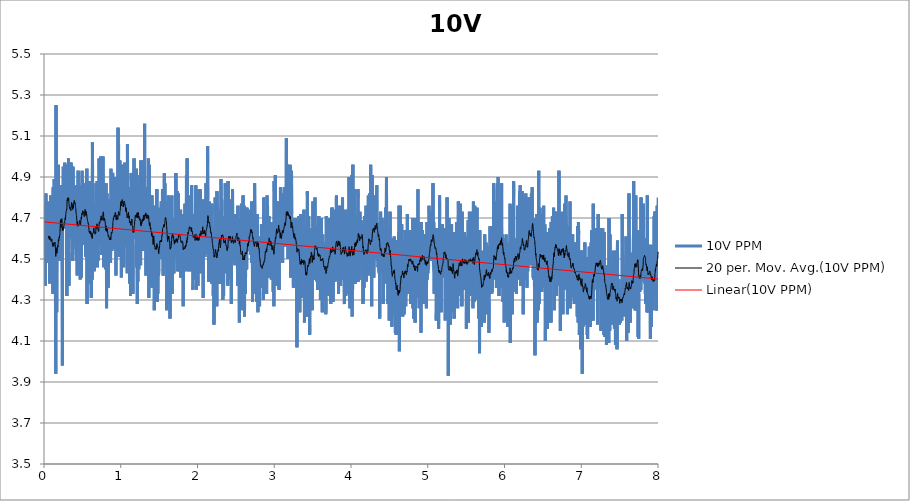
| Category | 10V PPM |
|---|---|
| 0.0009014404444444445 | 4.66 |
| 0.003960782083333334 | 4.77 |
| 0.007023179472222222 | 4.43 |
| 0.010082798916666667 | 4.67 |
| 0.013142973944444445 | 4.61 |
| 0.01620231561111111 | 4.37 |
| 0.019261657249999998 | 4.57 |
| 0.0223215545 | 4.72 |
| 0.02538089613888889 | 4.82 |
| 0.028439959999999997 | 4.61 |
| 0.03149930166666667 | 4.52 |
| 0.034559754472222225 | 4.61 |
| 0.037619373916666664 | 4.56 |
| 0.04067871558333333 | 4.59 |
| 0.043738057222222224 | 4.78 |
| 0.04679739888888889 | 4.67 |
| 0.04985701833333333 | 4.67 |
| 0.05291635997222222 | 4.48 |
| 0.05597597941666666 | 4.54 |
| 0.059035598861111115 | 4.49 |
| 0.06209466272222222 | 4.77 |
| 0.06515567113888888 | 4.49 |
| 0.06821584616666666 | 4.64 |
| 0.07127518780555556 | 4.6 |
| 0.07433480725 | 4.38 |
| 0.07739414891666667 | 4.66 |
| 0.08045321277777778 | 4.45 |
| 0.08351311 | 4.58 |
| 0.0865721738611111 | 4.81 |
| 0.08963151552777779 | 4.49 |
| 0.09269085716666665 | 4.53 |
| 0.09575158777777777 | 4.54 |
| 0.09881092944444443 | 4.74 |
| 0.10187082666666668 | 4.64 |
| 0.10492989052777778 | 4.49 |
| 0.10798923219444444 | 4.63 |
| 0.11104829602777777 | 4.45 |
| 0.11410763769444444 | 4.5 |
| 0.11716697933333332 | 4.33 |
| 0.12022604319444445 | 4.85 |
| 0.12328566263888889 | 4.48 |
| 0.12634500430555556 | 4.49 |
| 0.12940406816666666 | 4.65 |
| 0.132463132 | 4.89 |
| 0.13552330705555557 | 4.4 |
| 0.1385829265 | 4.57 |
| 0.1416422681388889 | 4.47 |
| 0.14470188758333333 | 4.65 |
| 0.14776122922222223 | 4.36 |
| 0.1508205708888889 | 4.18 |
| 0.15388019033333333 | 3.94 |
| 0.15693925419444443 | 5.25 |
| 0.15999859583333334 | 4.89 |
| 0.1630579375 | 4.43 |
| 0.16611700133333332 | 4.24 |
| 0.169176343 | 4.53 |
| 0.1722356846388889 | 4.68 |
| 0.17529530408333333 | 4.68 |
| 0.17835520133333335 | 4.68 |
| 0.18141454297222223 | 4.7 |
| 0.18447360683333333 | 4.71 |
| 0.1875368376111111 | 4.96 |
| 0.1905967348333333 | 4.68 |
| 0.19365718766666667 | 4.8 |
| 0.1967176405 | 4.73 |
| 0.1997792045 | 4.49 |
| 0.20284049069444443 | 4.68 |
| 0.2059014991111111 | 4.68 |
| 0.20896084075000002 | 4.78 |
| 0.21202101580555555 | 4.74 |
| 0.21508202419444444 | 4.51 |
| 0.21814247702777778 | 4.86 |
| 0.22120209647222222 | 4.49 |
| 0.22426393827777777 | 4.69 |
| 0.2273235577222222 | 4.74 |
| 0.23038428833333333 | 4.65 |
| 0.2334444633611111 | 4.65 |
| 0.23650630516666665 | 4.28 |
| 0.2395675913611111 | 3.98 |
| 0.24262915536111113 | 4.86 |
| 0.24568877480555557 | 4.79 |
| 0.24874811647222222 | 4.71 |
| 0.2518074581111111 | 4.95 |
| 0.25486791094444444 | 4.77 |
| 0.2579280859722222 | 4.83 |
| 0.2609913167222222 | 4.65 |
| 0.2640520473611111 | 4.91 |
| 0.26711722266666665 | 4.65 |
| 0.2701776755 | 4.97 |
| 0.2732603518055556 | 4.85 |
| 0.2763194156666667 | 4.75 |
| 0.2793798685 | 4.65 |
| 0.2824392101388889 | 4.86 |
| 0.28549882958333334 | 4.95 |
| 0.28855817125 | 4.9 |
| 0.29161751288888893 | 4.74 |
| 0.29467685455555553 | 4.76 |
| 0.29773619619444447 | 4.32 |
| 0.30079553786111113 | 4.89 |
| 0.30385515730555557 | 4.78 |
| 0.30691449894444445 | 4.84 |
| 0.3099752295555555 | 4.96 |
| 0.313034849 | 4.86 |
| 0.31609419066666666 | 4.58 |
| 0.31915325452777776 | 4.99 |
| 0.32221315175 | 4.73 |
| 0.32527582694444446 | 4.37 |
| 0.3283354463888889 | 4.53 |
| 0.3313945102222222 | 4.68 |
| 0.3344538518888889 | 4.77 |
| 0.33751486030555555 | 4.82 |
| 0.34057447975000005 | 4.75 |
| 0.34363382138888887 | 4.61 |
| 0.3466942742222222 | 4.97 |
| 0.3497558382222222 | 4.75 |
| 0.3528149020833333 | 4.97 |
| 0.3558742437222222 | 4.9 |
| 0.3589335853888889 | 4.77 |
| 0.3619934826111111 | 4.6 |
| 0.3650531020555556 | 4.95 |
| 0.3681121659166666 | 4.73 |
| 0.3711720631666667 | 4.86 |
| 0.37423612730555555 | 4.49 |
| 0.37729519116666665 | 4.95 |
| 0.38035508838888893 | 4.77 |
| 0.3834147078333333 | 4.83 |
| 0.38647488286111115 | 4.82 |
| 0.38953478011111115 | 4.59 |
| 0.39259439955555553 | 4.73 |
| 0.39565374119444446 | 4.86 |
| 0.3987130828611111 | 4.57 |
| 0.4017721467222222 | 4.68 |
| 0.4048314883611111 | 4.71 |
| 0.40789110780555554 | 4.65 |
| 0.4109504494722222 | 4.65 |
| 0.4140103466944445 | 4.81 |
| 0.4170694105555555 | 4.55 |
| 0.42012875222222223 | 4.56 |
| 0.4231883716666667 | 4.49 |
| 0.42624771330555555 | 4.6 |
| 0.4293081661388889 | 4.56 |
| 0.43236778558333333 | 4.42 |
| 0.43542740502777777 | 4.86 |
| 0.43848730225 | 4.71 |
| 0.4415466439166667 | 4.54 |
| 0.4446059855555556 | 4.93 |
| 0.44766532722222224 | 4.81 |
| 0.4507246688611111 | 4.64 |
| 0.4537840105 | 4.74 |
| 0.4568433521666667 | 4.85 |
| 0.45990324941666666 | 4.82 |
| 0.46296231325000003 | 4.84 |
| 0.46602304388888893 | 4.72 |
| 0.46908544124999996 | 4.6 |
| 0.47214506069444445 | 4.4 |
| 0.4752069025 | 4.68 |
| 0.47826652194444447 | 4.8 |
| 0.48132641919444447 | 4.71 |
| 0.48438576083333335 | 4.86 |
| 0.4874503805555555 | 4.41 |
| 0.4905097222222222 | 4.75 |
| 0.49357323077777776 | 4.75 |
| 0.49663423919444444 | 4.93 |
| 0.4996944142222222 | 4.57 |
| 0.5027543114444445 | 4.89 |
| 0.5058358766111111 | 4.78 |
| 0.50889994075 | 4.8 |
| 0.5119620603333334 | 4.69 |
| 0.5150222353611111 | 4.76 |
| 0.518081577 | 4.57 |
| 0.5211445299722222 | 4.67 |
| 0.5242149833888889 | 4.87 |
| 0.5272784919444444 | 4.66 |
| 0.5303408893055556 | 4.81 |
| 0.53340050875 | 4.85 |
| 0.5364606838055556 | 4.65 |
| 0.5395200254444444 | 4.6 |
| 0.5425793670833333 | 4.51 |
| 0.5456384309444444 | 4.73 |
| 0.5486983281944444 | 4.78 |
| 0.5517590588055555 | 4.68 |
| 0.5548203450277778 | 4.51 |
| 0.5578799644722222 | 4.94 |
| 0.5609398616944444 | 4.28 |
| 0.56400337025 | 4.75 |
| 0.5670652120555556 | 4.65 |
| 0.5701248315 | 4.71 |
| 0.5731861176944445 | 4.57 |
| 0.5762535153611111 | 4.62 |
| 0.579318412888889 | 4.61 |
| 0.5823780323333334 | 4.38 |
| 0.5854382073611112 | 4.58 |
| 0.5884981046111111 | 4.41 |
| 0.5915630021388889 | 4.88 |
| 0.5946242883333334 | 4.7 |
| 0.5976839077777778 | 4.63 |
| 0.6007438050277777 | 4.59 |
| 0.6038053690277777 | 4.72 |
| 0.6068669330277777 | 4.68 |
| 0.6099287748055556 | 4.51 |
| 0.6129889498611111 | 4.86 |
| 0.6160510694444444 | 4.31 |
| 0.6191159669722222 | 4.72 |
| 0.6221755864166667 | 4.45 |
| 0.62523465025 | 4.66 |
| 0.6282978810277777 | 4.4 |
| 0.6313580560555556 | 5.07 |
| 0.6344176755 | 4.73 |
| 0.6374772949444445 | 4.62 |
| 0.6405388589444444 | 4.63 |
| 0.6435987561944445 | 4.52 |
| 0.6466630981111111 | 4.74 |
| 0.6497257733055556 | 4.62 |
| 0.652786226111111 | 4.61 |
| 0.6558483457222222 | 4.44 |
| 0.6589090763333334 | 4.59 |
| 0.6619686957777777 | 4.56 |
| 0.6650305375555556 | 4.7 |
| 0.6680926571666667 | 4.77 |
| 0.671153943361111 | 4.65 |
| 0.6742143961944443 | 4.75 |
| 0.6772748490277777 | 4.87 |
| 0.6803408577222222 | 4.62 |
| 0.6834035328888889 | 4.55 |
| 0.6864650968888889 | 4.58 |
| 0.6895272164722223 | 4.81 |
| 0.6925868359166667 | 4.88 |
| 0.69564728875 | 4.46 |
| 0.698708019361111 | 4.63 |
| 0.7017695833611111 | 4.59 |
| 0.7048294806111112 | 4.49 |
| 0.70788882225 | 4.54 |
| 0.7109506640555556 | 4.63 |
| 0.7140100056944444 | 4.65 |
| 0.7170693473611112 | 4.99 |
| 0.7201292445833334 | 4.85 |
| 0.7231891418333333 | 4.6 |
| 0.7262487612777777 | 4.57 |
| 0.7293081029166667 | 4.92 |
| 0.7323674445833334 | 4.74 |
| 0.735427619611111 | 4.82 |
| 0.7384872390555556 | 5 |
| 0.7415490808333334 | 4.81 |
| 0.7446092558888889 | 4.64 |
| 0.7476683197222223 | 4.56 |
| 0.7507276613888889 | 4.52 |
| 0.7537872808333334 | 4.76 |
| 0.7568477336666667 | 4.62 |
| 0.7599104088333334 | 4.57 |
| 0.7629725284166666 | 4.58 |
| 0.7660352035833333 | 4.67 |
| 0.7690948230277778 | 5 |
| 0.7721549980833333 | 4.72 |
| 0.77521767325 | 4.6 |
| 0.778278403861111 | 4.46 |
| 0.7813383011111111 | 4.54 |
| 0.7843979205555556 | 4.77 |
| 0.7874619846944444 | 4.69 |
| 0.7905229931111112 | 4.82 |
| 0.79358233475 | 4.6 |
| 0.796642232 | 4.74 |
| 0.7997015736388889 | 4.61 |
| 0.80276230425 | 4.45 |
| 0.8058224793055556 | 4.51 |
| 0.8088851544722223 | 4.87 |
| 0.8119500519999999 | 4.64 |
| 0.8150093936388888 | 4.26 |
| 0.8180726244166667 | 4.63 |
| 0.8211352995833334 | 4.82 |
| 0.8241960301944444 | 4.54 |
| 0.8272562052222222 | 4.53 |
| 0.8303169358611111 | 4.72 |
| 0.8333787776388889 | 4.64 |
| 0.8364389526666667 | 4.36 |
| 0.8395002388888889 | 4.54 |
| 0.8425623584722222 | 4.56 |
| 0.845629478361111 | 4.67 |
| 0.8486899311666667 | 4.56 |
| 0.8517506618055556 | 4.67 |
| 0.8548116701944445 | 4.54 |
| 0.8578721230277777 | 4.79 |
| 0.8609361871666668 | 4.62 |
| 0.8639971955833333 | 4.66 |
| 0.8670573706111111 | 4.48 |
| 0.8701172678611111 | 4.64 |
| 0.8731793874444445 | 4.94 |
| 0.8762426182222223 | 4.61 |
| 0.8793025154444445 | 4.74 |
| 0.8823621348888889 | 4.7 |
| 0.8854234211111112 | 4.54 |
| 0.8884847073055555 | 4.67 |
| 0.8915448823333333 | 4.81 |
| 0.8946086686944444 | 4.92 |
| 0.8976716216666667 | 4.89 |
| 0.9007323522777777 | 4.72 |
| 0.903792805111111 | 4.83 |
| 0.9068554802777777 | 4.55 |
| 0.9099159331111111 | 4.81 |
| 0.9129813862222221 | 4.72 |
| 0.9160410056666667 | 4.61 |
| 0.9191053475833333 | 4.67 |
| 0.9221644114444444 | 4.65 |
| 0.9252254198611112 | 4.9 |
| 0.9282875394444444 | 4.62 |
| 0.9313468811111111 | 4.62 |
| 0.93440622275 | 4.55 |
| 0.9374661200000001 | 4.42 |
| 0.9405329620833334 | 4.6 |
| 0.9435923037222222 | 4.78 |
| 0.9466519231666666 | 4.82 |
| 0.9497129315833334 | 4.81 |
| 0.9527725510277778 | 4.65 |
| 0.9558330038611111 | 4.74 |
| 0.9588931788888889 | 4.79 |
| 0.9619536317222223 | 4.72 |
| 0.9650154734999999 | 5.14 |
| 0.9680750929444445 | 4.75 |
| 0.971134434611111 | 5.06 |
| 0.9741976653611111 | 4.54 |
| 0.9772586737777778 | 4.62 |
| 0.9803205155555555 | 4.51 |
| 0.9833823573611111 | 4.73 |
| 0.9864422546111111 | 4.8 |
| 0.989503818611111 | 4.98 |
| 0.9925651048055555 | 4.71 |
| 0.9956258354166666 | 4.89 |
| 0.9986851770833333 | 4.7 |
| 1.0017445187222223 | 4.84 |
| 1.0048041381666666 | 4.81 |
| 1.0078690356944444 | 4.41 |
| 1.0109311552777778 | 4.88 |
| 1.013991608111111 | 4.96 |
| 1.0170551166666666 | 4.91 |
| 1.0201155695 | 4.84 |
| 1.0231749111388888 | 4.65 |
| 1.0262353639722221 | 4.86 |
| 1.0292988725277779 | 4.79 |
| 1.0323601587222222 | 4.65 |
| 1.0354211671388889 | 4.83 |
| 1.038480231 | 4.46 |
| 1.0415395726666667 | 4.89 |
| 1.0446022478333334 | 4.78 |
| 1.0476668675555556 | 4.61 |
| 1.0507292649444444 | 4.97 |
| 1.0537894399722223 | 4.68 |
| 1.0568543375000001 | 4.74 |
| 1.0599150681111111 | 4.56 |
| 1.062986354888889 | 4.58 |
| 1.066047918888889 | 4.59 |
| 1.0691089273055554 | 4.77 |
| 1.07216854675 | 4.69 |
| 1.07523011075 | 4.73 |
| 1.0782894524166666 | 4.81 |
| 1.0813526831666667 | 4.59 |
| 1.0844161917222221 | 4.43 |
| 1.08747636675 | 5.06 |
| 1.090536264 | 4.81 |
| 1.093597828 | 4.78 |
| 1.0966588364166667 | 4.8 |
| 1.0997215115833332 | 4.7 |
| 1.1027819644166665 | 4.63 |
| 1.1058454729722222 | 4.44 |
| 1.1089062035833332 | 4.85 |
| 1.111968045388889 | 4.63 |
| 1.1150346096666668 | 4.38 |
| 1.1180945068888888 | 4.85 |
| 1.12115357075 | 4.39 |
| 1.1242181905 | 4.73 |
| 1.127277532138889 | 4.32 |
| 1.1303385405555555 | 4.76 |
| 1.1334020491111112 | 4.58 |
| 1.13646139075 | 4.92 |
| 1.1395285106388888 | 4.86 |
| 1.1425897968333334 | 4.71 |
| 1.1456519164166667 | 4.7 |
| 1.148711535861111 | 4.52 |
| 1.1517733776666668 | 4.7 |
| 1.1548354972500001 | 4.73 |
| 1.1578948389166668 | 4.33 |
| 1.160954458361111 | 4.57 |
| 1.1640140778055554 | 4.65 |
| 1.1670767529722221 | 4.68 |
| 1.1701363724166665 | 4.6 |
| 1.1731987698055557 | 4.99 |
| 1.1762589448333334 | 4.64 |
| 1.1793213422222222 | 4.93 |
| 1.1823812394444444 | 4.8 |
| 1.1854436368333334 | 4.76 |
| 1.1885040896666668 | 4.8 |
| 1.1915650980555557 | 4.66 |
| 1.1946291622222223 | 4.7 |
| 1.197691004 | 4.87 |
| 1.2007536791666666 | 4.74 |
| 1.2038191322777778 | 4.94 |
| 1.2068795851111112 | 4.46 |
| 1.2099419825 | 4.78 |
| 1.2130027131111112 | 4.86 |
| 1.2160642771111112 | 4.28 |
| 1.2191252855277779 | 4.81 |
| 1.2221901830555557 | 4.39 |
| 1.2252498025 | 4.65 |
| 1.2283138666388889 | 4.72 |
| 1.2313765418055556 | 4.73 |
| 1.2344406059722224 | 4.45 |
| 1.2375168930277778 | 4.83 |
| 1.240577623638889 | 4.76 |
| 1.2436372430833333 | 4.77 |
| 1.2466979737222221 | 4.57 |
| 1.2497628712222222 | 4.91 |
| 1.2528236018611112 | 4.72 |
| 1.2559004445 | 4.51 |
| 1.2589622863055554 | 4.47 |
| 1.2620213501666666 | 4.98 |
| 1.265085969888889 | 4.56 |
| 1.2681458671388888 | 4.84 |
| 1.271207431138889 | 4.7 |
| 1.2742951077222222 | 4.83 |
| 1.2773569495277777 | 4.63 |
| 1.28041684675 | 4.61 |
| 1.283477577388889 | 4.61 |
| 1.2865380301944445 | 4.62 |
| 1.2895995942222223 | 4.82 |
| 1.292662824972222 | 4.54 |
| 1.2957221666111112 | 4.98 |
| 1.2987826194444445 | 4.67 |
| 1.3018480725555555 | 4.56 |
| 1.304907692 | 4.7 |
| 1.3079703671666667 | 4.77 |
| 1.3110294310277777 | 5.16 |
| 1.3140896060555556 | 4.66 |
| 1.3171525590277777 | 4.55 |
| 1.3202119006944446 | 4.6 |
| 1.3232717979166666 | 4.8 |
| 1.32633225075 | 4.85 |
| 1.3293927035833333 | 4.42 |
| 1.3324534341944445 | 4.74 |
| 1.3355133314444445 | 4.68 |
| 1.3385751732222222 | 4.77 |
| 1.3416347926666667 | 4.83 |
| 1.3446955233055558 | 4.49 |
| 1.3477779218055554 | 4.69 |
| 1.3508389302222223 | 4.57 |
| 1.3539027165833333 | 4.56 |
| 1.356967891888889 | 4.83 |
| 1.3600344561944444 | 4.99 |
| 1.3630943534166666 | 4.51 |
| 1.3661567508055554 | 4.31 |
| 1.3692172036388888 | 4.57 |
| 1.372277100861111 | 4.96 |
| 1.3753433873611112 | 4.5 |
| 1.3784038401944445 | 4.81 |
| 1.38146734875 | 4.65 |
| 1.3845283571666667 | 4.41 |
| 1.3875882543888889 | 4.62 |
| 1.3906481516388887 | 4.57 |
| 1.3937077710833334 | 4.37 |
| 1.3967710018333332 | 4.66 |
| 1.3998325658333333 | 4.81 |
| 1.4028927408611112 | 4.38 |
| 1.405954304861111 | 4.81 |
| 1.4090161466666666 | 4.36 |
| 1.4120765995 | 4.45 |
| 1.4151448305277778 | 4.69 |
| 1.4182041721944445 | 4.56 |
| 1.42127240325 | 4.41 |
| 1.4243361895833333 | 4.72 |
| 1.4273988647777778 | 4.76 |
| 1.4304607065555555 | 4.75 |
| 1.4335419939166667 | 4.58 |
| 1.436603280111111 | 4.25 |
| 1.4396681776388889 | 4.46 |
| 1.442727519277778 | 4.61 |
| 1.4457876943333334 | 4.45 |
| 1.4488484249444447 | 4.31 |
| 1.4519102667500001 | 4.69 |
| 1.4549712751388888 | 4.36 |
| 1.4580356170833335 | 4.61 |
| 1.4610980144722223 | 4.72 |
| 1.4641587450833335 | 4.67 |
| 1.4672205868888888 | 4.61 |
| 1.4702821508888888 | 4.84 |
| 1.4733417703333334 | 4.29 |
| 1.4764033343333334 | 4.57 |
| 1.479462953777778 | 4.65 |
| 1.4825234065833333 | 4.33 |
| 1.485584970611111 | 4.54 |
| 1.4886551461944444 | 4.7 |
| 1.491714765638889 | 4.42 |
| 1.494774662888889 | 4.42 |
| 1.4978348379166666 | 4.45 |
| 1.5008950129444445 | 4.69 |
| 1.5039549101944443 | 4.75 |
| 1.5070253635833335 | 4.7 |
| 1.5101135957777778 | 4.72 |
| 1.5131734930277778 | 4.62 |
| 1.5162328346666667 | 4.52 |
| 1.5192921763055556 | 4.5 |
| 1.5223548515 | 4.68 |
| 1.5254158599166665 | 4.68 |
| 1.5284779795 | 4.78 |
| 1.5315375989444444 | 4.66 |
| 1.5345972183888887 | 4.75 |
| 1.5376612825277778 | 4.75 |
| 1.5407220131388888 | 4.66 |
| 1.5437852439166666 | 4.84 |
| 1.5468451411388888 | 4.67 |
| 1.549905038388889 | 4.8 |
| 1.5529652134166667 | 4.42 |
| 1.5560270552222222 | 4.52 |
| 1.5590861190555556 | 4.62 |
| 1.5621460163055556 | 4.71 |
| 1.5652061913333333 | 4.51 |
| 1.5682691443055556 | 4.92 |
| 1.571330986111111 | 4.67 |
| 1.5743953280277778 | 4.87 |
| 1.5774546696944445 | 4.71 |
| 1.5805176226666668 | 4.78 |
| 1.5835786310833333 | 4.73 |
| 1.58664130625 | 4.65 |
| 1.5897014812777777 | 4.59 |
| 1.592761934111111 | 4.57 |
| 1.5958271094166667 | 4.53 |
| 1.5988897845833334 | 4.25 |
| 1.6019502374166668 | 4.42 |
| 1.6050126348055556 | 4.33 |
| 1.6080775323333334 | 4.3 |
| 1.6111452077777777 | 4.61 |
| 1.6142062161944444 | 4.52 |
| 1.6172655578611113 | 4.77 |
| 1.6203268440555556 | 4.81 |
| 1.6233867413055554 | 4.44 |
| 1.6264460829444445 | 4.76 |
| 1.6295065357777778 | 4.64 |
| 1.6325661552222221 | 4.63 |
| 1.6356304971666666 | 4.62 |
| 1.6386928945277777 | 4.7 |
| 1.6417594588333335 | 4.21 |
| 1.6448243563333333 | 4.6 |
| 1.6478839758055557 | 4.8 |
| 1.6509441508333333 | 4.56 |
| 1.6540037702777777 | 4.59 |
| 1.657065889861111 | 4.75 |
| 1.660135509861111 | 4.5 |
| 1.6631951293055556 | 4.65 |
| 1.6662608602222222 | 4.81 |
| 1.6693207574722222 | 4.33 |
| 1.6723814880833334 | 4.64 |
| 1.6754458300277777 | 4.7 |
| 1.67851044975 | 4.5 |
| 1.6815697913888887 | 4.64 |
| 1.6846302442222223 | 4.64 |
| 1.687689585888889 | 4.66 |
| 1.6907672619166667 | 4.43 |
| 1.6938313260555555 | 4.44 |
| 1.6968909455 | 4.44 |
| 1.699950009361111 | 4.56 |
| 1.7030107399722223 | 4.58 |
| 1.706070637222222 | 4.58 |
| 1.7091327568055554 | 4.58 |
| 1.7121926540277779 | 4.68 |
| 1.7152592183333333 | 4.67 |
| 1.7183199489444445 | 4.92 |
| 1.7213815129444445 | 4.51 |
| 1.7244430769444443 | 4.67 |
| 1.7275024185833334 | 4.57 |
| 1.7305617602499999 | 4.55 |
| 1.7336213796944444 | 4.54 |
| 1.7366859994166668 | 4.44 |
| 1.7397456188611111 | 4.83 |
| 1.7428063494722221 | 4.62 |
| 1.7458659689166667 | 4.65 |
| 1.7489272551388888 | 4.68 |
| 1.75198798575 | 4.82 |
| 1.755047883 | 4.44 |
| 1.7581091691944446 | 4.53 |
| 1.761168510861111 | 4.52 |
| 1.7642289636666666 | 4.64 |
| 1.7672888609166666 | 4.48 |
| 1.7703543140277778 | 4.58 |
| 1.7734136556666666 | 4.51 |
| 1.7764741085 | 4.5 |
| 1.7795367836666667 | 4.74 |
| 1.7825966809166667 | 4.41 |
| 1.7856621340277776 | 4.56 |
| 1.788732309638889 | 4.58 |
| 1.7917941514166666 | 4.55 |
| 1.7948587711666666 | 4.56 |
| 1.797921724138889 | 4.58 |
| 1.8009835659166666 | 4.72 |
| 1.804043185361111 | 4.5 |
| 1.8071036381944443 | 4.72 |
| 1.810167980138889 | 4.54 |
| 1.8132281551666667 | 4.27 |
| 1.8162922193055555 | 4.5 |
| 1.8193518387499998 | 4.6 |
| 1.8224142361388889 | 4.57 |
| 1.8254744111666665 | 4.54 |
| 1.8285354195833332 | 4.45 |
| 1.831596428 | 4.65 |
| 1.8346591031666668 | 4.44 |
| 1.8377203893611112 | 4.77 |
| 1.8407825089444443 | 4.61 |
| 1.843842128388889 | 4.57 |
| 1.8469100816666666 | 4.65 |
| 1.8499697011111111 | 4.45 |
| 1.8530320984722224 | 4.7 |
| 1.8560922735277778 | 4.91 |
| 1.85915217075 | 4.64 |
| 1.8622123457777777 | 4.51 |
| 1.8652747431666665 | 4.99 |
| 1.868336029361111 | 4.54 |
| 1.8714037048333332 | 4.7 |
| 1.87446471325 | 4.79 |
| 1.8775243326944444 | 4.44 |
| 1.8805842299166668 | 4.52 |
| 1.8836444049722223 | 4.81 |
| 1.886703746611111 | 4.56 |
| 1.8897650328055555 | 4.69 |
| 1.8928393753333332 | 4.77 |
| 1.8959012171111111 | 4.53 |
| 1.8989611143611111 | 4.6 |
| 1.9020224005555555 | 4.73 |
| 1.9050831311944443 | 4.49 |
| 1.9081455285555555 | 4.64 |
| 1.9112098704999998 | 4.44 |
| 1.914268934361111 | 4.67 |
| 1.9173382765833333 | 4.71 |
| 1.9203976182222222 | 4.58 |
| 1.9234569598888889 | 4.86 |
| 1.9265168571388889 | 4.62 |
| 1.9295770321666665 | 4.58 |
| 1.93263915175 | 4.62 |
| 1.9357034936944446 | 4.6 |
| 1.9387642243055554 | 4.35 |
| 1.9418246771388887 | 4.37 |
| 1.9448842965833335 | 4.71 |
| 1.9479461383611112 | 4.61 |
| 1.9510071467777779 | 4.69 |
| 1.9540695441666667 | 4.72 |
| 1.9571322193333334 | 4.66 |
| 1.9601932277499998 | 4.71 |
| 1.9632561807222222 | 4.4 |
| 1.9663158001666667 | 4.45 |
| 1.969375419611111 | 4.45 |
| 1.9724361502222223 | 4.74 |
| 1.9755060480277777 | 4.81 |
| 1.9785670564444444 | 4.86 |
| 1.981632787361111 | 4.57 |
| 1.984692129 | 4.35 |
| 1.987778138861111 | 4.78 |
| 1.9908410918055557 | 4.5 |
| 1.99390543375 | 4.54 |
| 1.996967831138889 | 4.56 |
| 2.0000391179166668 | 4.59 |
| 2.003100126333333 | 4.45 |
| 2.0061655794444446 | 4.37 |
| 2.0092260322777777 | 4.68 |
| 2.012285373916667 | 4.84 |
| 2.0153494380555554 | 4.58 |
| 2.0184121132222224 | 4.6 |
| 2.0214772885555554 | 4.78 |
| 2.024551353277778 | 4.67 |
| 2.027610694916667 | 4.68 |
| 2.0306705921666666 | 4.43 |
| 2.0337324339444445 | 4.84 |
| 2.036796498083333 | 4.76 |
| 2.0398583398888888 | 4.69 |
| 2.0429182371388888 | 4.77 |
| 2.0459778565833333 | 4.64 |
| 2.049037476027778 | 4.45 |
| 2.052096539861111 | 4.51 |
| 2.0551581038611113 | 4.61 |
| 2.058221612416667 | 4.48 |
| 2.0612845653888887 | 4.65 |
| 2.0643450182222223 | 4.67 |
| 2.0674046376666664 | 4.79 |
| 2.070464534916667 | 4.58 |
| 2.073526932277778 | 4.31 |
| 2.076586829527778 | 4.65 |
| 2.0796483935277776 | 4.7 |
| 2.082708012972222 | 4.7 |
| 2.0857687435833334 | 4.72 |
| 2.088830585388889 | 4.62 |
| 2.0918952051111113 | 4.69 |
| 2.0949556579444444 | 4.51 |
| 2.098015832972222 | 4.68 |
| 2.101076008 | 4.79 |
| 2.1041364608333333 | 4.53 |
| 2.107197747027778 | 4.62 |
| 2.1102618111666667 | 4.87 |
| 2.1133217084166667 | 4.61 |
| 2.116382439027778 | 4.65 |
| 2.1194476143611114 | 4.65 |
| 2.122510845111111 | 4.73 |
| 2.1255707423611114 | 4.87 |
| 2.128630639583333 | 4.79 |
| 2.1316910924166668 | 5.05 |
| 2.134754323194444 | 4.79 |
| 2.1378161649722225 | 4.52 |
| 2.140891340861111 | 4.7 |
| 2.143952904861111 | 4.39 |
| 2.1470136355 | 4.48 |
| 2.1500738105277777 | 4.58 |
| 2.1531362078888887 | 4.78 |
| 2.1561997164444446 | 4.5 |
| 2.159259058111111 | 4.45 |
| 2.1623211776944444 | 4.54 |
| 2.165380797138889 | 4.55 |
| 2.168440694388889 | 4.51 |
| 2.171500313833333 | 4.5 |
| 2.174566322527778 | 4.49 |
| 2.1776345535555555 | 4.71 |
| 2.180694173027778 | 4.55 |
| 2.1837543480555555 | 4.38 |
| 2.1868145230833336 | 4.77 |
| 2.189876364861111 | 4.72 |
| 2.1929357065277775 | 4.72 |
| 2.195994770388889 | 4.59 |
| 2.1990557788055556 | 4.45 |
| 2.202122065277778 | 4.38 |
| 2.205185851638889 | 4.32 |
| 2.2082549160555556 | 4.38 |
| 2.2113162022777777 | 4.62 |
| 2.2143777662777775 | 4.18 |
| 2.2174398858611113 | 4.37 |
| 2.220501449861111 | 4.63 |
| 2.2235610693055556 | 4.42 |
| 2.2266315226944444 | 4.53 |
| 2.2296936422777778 | 4.8 |
| 2.2327535395277778 | 4.72 |
| 2.2358131589722223 | 4.69 |
| 2.2388722228333333 | 4.49 |
| 2.2419321200555555 | 4.53 |
| 2.245003406861111 | 4.3 |
| 2.2480641374722223 | 4.72 |
| 2.2511262570555557 | 4.27 |
| 2.2541872654722224 | 4.83 |
| 2.2572485516666667 | 4.63 |
| 2.2603081711111113 | 4.76 |
| 2.2633711240833336 | 4.51 |
| 2.2664324103055553 | 4.49 |
| 2.2694920297500003 | 4.44 |
| 2.272554149333333 | 4.45 |
| 2.2756151577500003 | 4.59 |
| 2.2786772773333333 | 4.74 |
| 2.281743841611111 | 4.6 |
| 2.284804294444444 | 4.68 |
| 2.2878683585833333 | 4.71 |
| 2.2909993710000003 | 4.38 |
| 2.2940617683888886 | 4.59 |
| 2.2971222211944444 | 4.38 |
| 2.3001821184444444 | 4.68 |
| 2.3032453491944445 | 4.7 |
| 2.3063083021666664 | 4.89 |
| 2.309372366305556 | 4.63 |
| 2.3124325413611113 | 4.64 |
| 2.3154943831388892 | 4.79 |
| 2.318555113777778 | 4.67 |
| 2.3216177889444443 | 4.66 |
| 2.324679908527778 | 4.6 |
| 2.327741472527778 | 4.55 |
| 2.33080609225 | 4.3 |
| 2.3338696008055555 | 4.46 |
| 2.3369286646666665 | 4.4 |
| 2.3399896730833336 | 4.32 |
| 2.343052070472222 | 4.54 |
| 2.3461122455 | 4.71 |
| 2.349174642888889 | 4.71 |
| 2.3522350956944447 | 4.5 |
| 2.355294437361111 | 4.43 |
| 2.3583540568055557 | 4.53 |
| 2.3614150652222223 | 4.87 |
| 2.364474406861111 | 4.55 |
| 2.367534304111111 | 4.62 |
| 2.3705978126666665 | 4.47 |
| 2.373657432111111 | 4.66 |
| 2.376725385361111 | 4.73 |
| 2.3797897273055555 | 4.51 |
| 2.382854069222222 | 4.49 |
| 2.3859145220555558 | 4.46 |
| 2.3889744193055553 | 4.63 |
| 2.3920526509166664 | 4.55 |
| 2.3951256044444444 | 4.37 |
| 2.398185223888889 | 4.88 |
| 2.4012484546666664 | 4.73 |
| 2.4043114076388887 | 4.78 |
| 2.4073724160555554 | 4.68 |
| 2.410434535638889 | 4.52 |
| 2.4134972108055557 | 4.62 |
| 2.4165571080555557 | 4.47 |
| 2.4196172830833333 | 4.64 |
| 2.42268468075 | 4.46 |
| 2.425744022388889 | 4.62 |
| 2.428805030805556 | 4.79 |
| 2.4318643724722224 | 4.6 |
| 2.4349237141111115 | 4.4 |
| 2.4379858336944444 | 4.61 |
| 2.441080455138889 | 4.28 |
| 2.4441411857777777 | 4.61 |
| 2.4472069166666666 | 4.54 |
| 2.4502670916944442 | 4.59 |
| 2.4533328226111113 | 4.52 |
| 2.456394386611111 | 4.84 |
| 2.4594551172222223 | 4.6 |
| 2.4625164034444444 | 4.67 |
| 2.465579078611111 | 4.64 |
| 2.468639531444444 | 4.49 |
| 2.471699706472222 | 4.69 |
| 2.474760714888889 | 4.71 |
| 2.47781977875 | 4.59 |
| 2.4808824539166667 | 4.64 |
| 2.4839426289444444 | 4.52 |
| 2.4870030817777775 | 4.47 |
| 2.4900638123888887 | 4.58 |
| 2.493125376388889 | 4.72 |
| 2.496185829222222 | 4.55 |
| 2.499245170861111 | 4.71 |
| 2.502305068111111 | 4.55 |
| 2.5053696878333334 | 4.68 |
| 2.508434029777778 | 4.54 |
| 2.5114961493611108 | 4.69 |
| 2.514556324388889 | 4.65 |
| 2.5176176106111114 | 4.52 |
| 2.520678619 | 4.45 |
| 2.523744627722222 | 4.37 |
| 2.526805358333333 | 4.76 |
| 2.5298680335 | 4.71 |
| 2.532930430888889 | 4.67 |
| 2.535990883722222 | 4.64 |
| 2.5390516143333333 | 4.63 |
| 2.542113456138889 | 4.37 |
| 2.5451741867499997 | 4.19 |
| 2.548234917361111 | 4.7 |
| 2.5512987037222223 | 4.65 |
| 2.5543594343333336 | 4.26 |
| 2.557419331583333 | 4.56 |
| 2.5604795066111112 | 4.31 |
| 2.5635388482500003 | 4.28 |
| 2.5665987455 | 4.56 |
| 2.569661420666667 | 4.47 |
| 2.5727254848055554 | 4.77 |
| 2.5757853820555554 | 4.63 |
| 2.578853890888889 | 4.53 |
| 2.5819146215 | 4.5 |
| 2.5849761855000004 | 4.59 |
| 2.5880358049444445 | 4.38 |
| 2.59109598 | 4.25 |
| 2.5941561550277776 | 4.81 |
| 2.5972185523888887 | 4.47 |
| 2.600279838611111 | 4.73 |
| 2.6033402914444443 | 4.31 |
| 2.6064029666111113 | 4.52 |
| 2.6094628638333335 | 4.76 |
| 2.6125394286944443 | 4.22 |
| 2.61560765975 | 4.63 |
| 2.618672557277778 | 4.57 |
| 2.621734399083333 | 4.61 |
| 2.624794851888889 | 4.33 |
| 2.6278553047222224 | 4.54 |
| 2.6309143685833334 | 4.45 |
| 2.633975099194444 | 4.64 |
| 2.637034718638889 | 4.75 |
| 2.6400968382222225 | 4.45 |
| 2.6431631247222223 | 4.65 |
| 2.646222466388889 | 4.75 |
| 2.6492831970000004 | 4.58 |
| 2.6523430942222226 | 4.73 |
| 2.6554052138333333 | 4.54 |
| 2.6584648332777774 | 4.71 |
| 2.6615288974166664 | 4.57 |
| 2.664593794944444 | 4.64 |
| 2.6676536921666667 | 4.63 |
| 2.6707141450000003 | 4.65 |
| 2.673788765305556 | 4.73 |
| 2.676850884888889 | 4.6 |
| 2.6799163380000004 | 4.68 |
| 2.6829815133055557 | 4.63 |
| 2.6860422439444442 | 4.62 |
| 2.689103530138889 | 4.59 |
| 2.6921642607500003 | 4.74 |
| 2.695235825333333 | 4.52 |
| 2.698299333888889 | 4.57 |
| 2.7013633980277776 | 4.59 |
| 2.704428017777778 | 4.78 |
| 2.707487637222222 | 4.48 |
| 2.71054781225 | 4.66 |
| 2.71360937625 | 4.59 |
| 2.7166689956944445 | 4.29 |
| 2.719728615138889 | 4.48 |
| 2.7227890679444444 | 4.64 |
| 2.7258553544444446 | 4.47 |
| 2.728914696111111 | 4.33 |
| 2.7319745933333333 | 4.5 |
| 2.7350339349999997 | 4.66 |
| 2.7380938322222224 | 4.5 |
| 2.741154285055556 | 4.59 |
| 2.7442172380277774 | 4.87 |
| 2.7472790798055557 | 4.72 |
| 2.7503406438055555 | 4.67 |
| 2.753401374444444 | 4.65 |
| 2.7564634940277775 | 4.61 |
| 2.7595245024444446 | 4.61 |
| 2.7625855108611113 | 4.59 |
| 2.765645685888889 | 4.54 |
| 2.7687050275277776 | 4.29 |
| 2.7717663137499997 | 4.67 |
| 2.7748459343333334 | 4.51 |
| 2.7779058315555556 | 4.72 |
| 2.780974062611111 | 4.6 |
| 2.7840378489722224 | 4.44 |
| 2.7870974684166665 | 4.24 |
| 2.7901584768333336 | 4.47 |
| 2.7932214297777778 | 4.6 |
| 2.796280493638889 | 4.28 |
| 2.7993409464722223 | 4.35 |
| 2.8024011215 | 4.61 |
| 2.8054632410833333 | 4.51 |
| 2.808522860527778 | 4.27 |
| 2.81158886925 | 4.53 |
| 2.8146509888333333 | 4.47 |
| 2.817710608277778 | 4.37 |
| 2.820769672138889 | 4.36 |
| 2.8238304027499996 | 4.52 |
| 2.826890022194444 | 4.43 |
| 2.8299504750277777 | 4.38 |
| 2.8330095388611114 | 4.67 |
| 2.8360708250833335 | 4.39 |
| 2.839135722611111 | 4.61 |
| 2.842198953361111 | 4.57 |
| 2.8452602395833333 | 4.51 |
| 2.848325414888889 | 4.46 |
| 2.851385867722222 | 4.57 |
| 2.8544465983333334 | 4.53 |
| 2.8575064955833334 | 4.3 |
| 2.8605669483888887 | 4.44 |
| 2.8636287901944444 | 4.8 |
| 2.8666900763888887 | 4.49 |
| 2.8697502514444446 | 4.43 |
| 2.872819038083333 | 4.49 |
| 2.8758819910277778 | 4.64 |
| 2.8789416104722223 | 4.64 |
| 2.8820015077222223 | 4.71 |
| 2.885063905111111 | 4.7 |
| 2.8881243579166664 | 4.41 |
| 2.891183699583333 | 4.33 |
| 2.894243319027778 | 4.66 |
| 2.89730321625 | 4.7 |
| 2.900367002611111 | 4.33 |
| 2.903427455444444 | 4.69 |
| 2.906492352972222 | 4.81 |
| 2.9095572505 | 4.66 |
| 2.9126185366944446 | 4.76 |
| 2.915684545388889 | 4.41 |
| 2.9187447204166665 | 4.5 |
| 2.9218060066388887 | 4.41 |
| 2.924878404583333 | 4.63 |
| 2.9279380240277777 | 4.65 |
| 2.93100264375 | 4.71 |
| 2.934066430111111 | 4.71 |
| 2.937129105277778 | 4.48 |
| 2.9401884469444446 | 4.53 |
| 2.9432600115 | 4.5 |
| 2.946319353166667 | 4.42 |
| 2.949380361583333 | 4.5 |
| 2.9524397032222223 | 4.68 |
| 2.9555026561944446 | 4.62 |
| 2.958562553416667 | 4.54 |
| 2.9616235618333335 | 4.4 |
| 2.9646854036388888 | 4.43 |
| 2.967746689833333 | 4.44 |
| 2.9708079760555552 | 4.68 |
| 2.97388676325 | 4.62 |
| 2.976946104916667 | 4.65 |
| 2.9800079466944442 | 4.6 |
| 2.983067288361111 | 4.52 |
| 2.9861285745555555 | 4.34 |
| 2.9891901385555557 | 4.65 |
| 2.992253647111111 | 4.59 |
| 2.9953252116944444 | 4.27 |
| 2.9983867756944442 | 4.88 |
| 3.0014461173333333 | 4.83 |
| 3.0045057367777774 | 4.59 |
| 3.00756868975 | 4.56 |
| 3.01063025375 | 4.8 |
| 3.0136940401111114 | 4.91 |
| 3.0167550485277776 | 4.8 |
| 3.0198152235555558 | 4.44 |
| 3.022879843277778 | 4.59 |
| 3.0259400183055556 | 4.78 |
| 3.029002971277778 | 4.75 |
| 3.03206592425 | 4.77 |
| 3.0351272104444442 | 4.37 |
| 3.0381887744444445 | 4.53 |
| 3.041249505083333 | 4.6 |
| 3.044309957888889 | 4.47 |
| 3.0473773555555557 | 4.58 |
| 3.050436697222222 | 4.67 |
| 3.053500205777778 | 4.78 |
| 3.0565601030000003 | 4.61 |
| 3.05962000025 | 4.74 |
| 3.062684619972222 | 4.35 |
| 3.065747295166666 | 4.69 |
| 3.0688255267777778 | 4.63 |
| 3.071885146222222 | 4.59 |
| 3.0749455990555554 | 4.59 |
| 3.078007718638889 | 4.5 |
| 3.0810701160277776 | 4.85 |
| 3.084139736027778 | 4.71 |
| 3.087205744722222 | 4.55 |
| 3.0902656419722225 | 4.63 |
| 3.0933274837777778 | 4.56 |
| 3.096386825416667 | 4.53 |
| 3.0994458892777774 | 4.75 |
| 3.1025082866666667 | 4.71 |
| 3.105568739472222 | 4.77 |
| 3.108628358916667 | 4.48 |
| 3.1116882561666666 | 4.7 |
| 3.1147492645833337 | 4.59 |
| 3.117811106361111 | 4.82 |
| 3.1208704480277776 | 4.74 |
| 3.1239317342222224 | 4.56 |
| 3.126991631472222 | 4.74 |
| 3.130051528694444 | 4.85 |
| 3.1331122593333336 | 4.63 |
| 3.1361721565555554 | 4.76 |
| 3.1392342761388887 | 4.61 |
| 3.1422969513333334 | 4.58 |
| 3.1453626822222223 | 4.78 |
| 3.148424524027778 | 4.75 |
| 3.151497755361111 | 4.81 |
| 3.1545629306666667 | 4.87 |
| 3.1576308839444445 | 5.09 |
| 3.160690225583333 | 4.62 |
| 3.1637740130833336 | 4.56 |
| 3.1668372438333336 | 4.69 |
| 3.169897141083333 | 4.57 |
| 3.1729578716944444 | 4.96 |
| 3.1760172133333335 | 4.62 |
| 3.1790768327777776 | 4.5 |
| 3.1821386745833333 | 4.84 |
| 3.1852057944722225 | 4.61 |
| 3.188267080666667 | 4.51 |
| 3.1913344783333333 | 4.83 |
| 3.1943960423333335 | 4.72 |
| 3.197455383972222 | 4.54 |
| 3.200515559027778 | 4.51 |
| 3.203575178472222 | 4.52 |
| 3.2066342423055554 | 4.96 |
| 3.2096971952777777 | 4.83 |
| 3.212758759277778 | 4.41 |
| 3.215818378722222 | 4.72 |
| 3.2188788315555557 | 4.52 |
| 3.2219428956944447 | 4.77 |
| 3.225003348527778 | 4.93 |
| 3.2280660236944443 | 4.72 |
| 3.2311250875555557 | 4.51 |
| 3.234185540388889 | 4.6 |
| 3.237255716 | 4.66 |
| 3.2403172799999997 | 4.41 |
| 3.243377455027778 | 4.5 |
| 3.246440685777778 | 4.45 |
| 3.2495016941944446 | 4.36 |
| 3.2525646471666665 | 4.53 |
| 3.255624266611111 | 4.65 |
| 3.2586958311944443 | 4.54 |
| 3.261757672972222 | 4.7 |
| 3.2648167368333336 | 4.7 |
| 3.2678760784722223 | 4.68 |
| 3.270937642472222 | 4.57 |
| 3.2739972619166666 | 4.59 |
| 3.277059937111111 | 4.65 |
| 3.2801212233055552 | 4.43 |
| 3.2831819539166665 | 4.61 |
| 3.286241573388889 | 4.7 |
| 3.289308971055555 | 4.44 |
| 3.2923691460833333 | 4.46 |
| 3.295429321111111 | 4.07 |
| 3.298491162888889 | 4.68 |
| 3.3015543936666663 | 4.54 |
| 3.3046137353055554 | 4.65 |
| 3.307673076972222 | 4.42 |
| 3.310733807583333 | 4.37 |
| 3.313798705111111 | 4.39 |
| 3.3168586023333333 | 4.71 |
| 3.3199179439999997 | 4.57 |
| 3.322977007861111 | 4.53 |
| 3.3260394052500004 | 4.33 |
| 3.3291098586388888 | 4.52 |
| 3.332169200277778 | 4.24 |
| 3.335231875472222 | 4.42 |
| 3.338297050777778 | 4.4 |
| 3.3413594481666666 | 4.62 |
| 3.3444243456944442 | 4.72 |
| 3.3474920211388888 | 4.62 |
| 3.3505519183888888 | 4.31 |
| 3.353612093416667 | 4.38 |
| 3.3566719906666664 | 4.53 |
| 3.3597363325833336 | 4.51 |
| 3.362799007777778 | 4.57 |
| 3.3658600161666667 | 4.46 |
| 3.3689243581111112 | 4.58 |
| 3.371989255638889 | 4.42 |
| 3.375049152888889 | 4.4 |
| 3.3781087723333334 | 4.49 |
| 3.3811681139722225 | 4.54 |
| 3.3842310669444444 | 4.41 |
| 3.3872931865277778 | 4.74 |
| 3.39036725125 | 4.42 |
| 3.393427426277778 | 4.19 |
| 3.396500379805556 | 4.35 |
| 3.3995677774722224 | 4.48 |
| 3.4026307304444448 | 4.3 |
| 3.4056922944444445 | 4.23 |
| 3.4087602477222223 | 4.22 |
| 3.4118193115555555 | 4.24 |
| 3.4148819867499998 | 4.5 |
| 3.4179504955833333 | 4.66 |
| 3.4210109484166664 | 4.22 |
| 3.4240714012222226 | 4.64 |
| 3.427130742888889 | 4.65 |
| 3.4301923068888893 | 4.83 |
| 3.4332530374999997 | 4.8 |
| 3.4363165460555556 | 4.47 |
| 3.439379499027778 | 4.37 |
| 3.4424457855277777 | 4.55 |
| 3.445505404972222 | 4.55 |
| 3.448566413388889 | 4.71 |
| 3.4516268661944443 | 4.66 |
| 3.4546892635833335 | 4.45 |
| 3.4577488830277776 | 4.51 |
| 3.460808502472222 | 4.13 |
| 3.4638789558611114 | 4.18 |
| 3.466939130916667 | 4.31 |
| 3.470000417111111 | 4.48 |
| 3.4730617033333333 | 4.53 |
| 3.4761246562777774 | 4.6 |
| 3.479186498083333 | 4.6 |
| 3.4822466731111112 | 4.65 |
| 3.4853060147777777 | 4.56 |
| 3.4883664675833335 | 4.6 |
| 3.4914277538055556 | 4.51 |
| 3.4944870954444442 | 4.25 |
| 3.497547548277778 | 4.6 |
| 3.5006093900555557 | 4.64 |
| 3.5036690095 | 4.78 |
| 3.5067294623333334 | 4.59 |
| 3.5097996379444445 | 4.5 |
| 3.512859257388889 | 4.43 |
| 3.5159194324166667 | 4.64 |
| 3.5189812742222224 | 4.42 |
| 3.5220420048333336 | 4.74 |
| 3.525105513388889 | 4.4 |
| 3.528168466361111 | 4.45 |
| 3.5312344750555558 | 4.8 |
| 3.534298539194445 | 4.44 |
| 3.537359269805555 | 4.61 |
| 3.5404200004444446 | 4.66 |
| 3.543486009138889 | 4.47 |
| 3.546553962388889 | 4.5 |
| 3.5496135818333334 | 4.5 |
| 3.552677923777778 | 4.58 |
| 3.555741154527778 | 4.39 |
| 3.558801607361111 | 4.47 |
| 3.5618617823888887 | 4.53 |
| 3.564922513 | 4.35 |
| 3.56798241025 | 4.47 |
| 3.571042585277778 | 4.48 |
| 3.574104149277778 | 4.55 |
| 3.577169602388889 | 4.43 |
| 3.580229221833333 | 4.71 |
| 3.5832885635 | 4.51 |
| 3.5863490163055554 | 4.45 |
| 3.5894153028055555 | 4.5 |
| 3.5924782557777775 | 4.67 |
| 3.5955384308055556 | 4.55 |
| 3.598603606138889 | 4.5 |
| 3.6016635033611113 | 4.3 |
| 3.6047275675000003 | 4.46 |
| 3.6077899648888887 | 4.41 |
| 3.6108526400555556 | 4.51 |
| 3.6139142040555554 | 4.7 |
| 3.6169735457222223 | 4.38 |
| 3.620033998555556 | 4.48 |
| 3.62310000725 | 4.59 |
| 3.6261607378611114 | 4.24 |
| 3.6292211906944445 | 4.51 |
| 3.6322810879166667 | 4.62 |
| 3.635340429583333 | 4.38 |
| 3.63840310475 | 4.34 |
| 3.641469669027778 | 4.43 |
| 3.644529566277778 | 4.35 |
| 3.6475897413055556 | 4.3 |
| 3.6506513053055554 | 4.58 |
| 3.653711758138889 | 4.55 |
| 3.656771377583333 | 4.38 |
| 3.6598340527500004 | 4.46 |
| 3.662893394416667 | 4.42 |
| 3.665953013861111 | 4.57 |
| 3.669021244888889 | 4.47 |
| 3.6720825311111107 | 4.23 |
| 3.6751457618611107 | 4.31 |
| 3.678210659388889 | 4.71 |
| 3.6812755569166664 | 4.42 |
| 3.6843368431111108 | 4.69 |
| 3.6873964625555558 | 4.54 |
| 3.6904580265555555 | 4.55 |
| 3.6935220907222224 | 4.57 |
| 3.696581710166667 | 4.32 |
| 3.699641607388889 | 4.66 |
| 3.7027015046388887 | 4.53 |
| 3.7057636242222225 | 4.47 |
| 3.7088232436666666 | 4.45 |
| 3.711882863111111 | 4.7 |
| 3.714943038138889 | 4.66 |
| 3.7180051577222226 | 4.51 |
| 3.721067832916667 | 4.4 |
| 3.7241293969166667 | 4.57 |
| 3.7271951278055555 | 4.62 |
| 3.730255580638889 | 4.67 |
| 3.7333149222777777 | 4.69 |
| 3.7363773196666665 | 4.28 |
| 3.7394399948333334 | 4.43 |
| 3.7424993365 | 4.41 |
| 3.745558678138889 | 4.56 |
| 3.7486227422777776 | 4.75 |
| 3.7516837506944447 | 4.53 |
| 3.7547436479444443 | 4.5 |
| 3.7578146569166666 | 4.75 |
| 3.7608739985833335 | 4.7 |
| 3.763936118166667 | 4.5 |
| 3.7669954598055555 | 4.29 |
| 3.770057579388889 | 4.43 |
| 3.773121087944445 | 4.51 |
| 3.7761809851944443 | 4.66 |
| 3.7792406046388893 | 4.52 |
| 3.7823080023055557 | 4.55 |
| 3.7853706774722222 | 4.42 |
| 3.7884308525277777 | 4.62 |
| 3.7915015836944446 | 4.39 |
| 3.794564258888889 | 4.72 |
| 3.797624156111111 | 4.6 |
| 3.8006923871666665 | 4.74 |
| 3.8037525621944446 | 4.7 |
| 3.80681607075 | 4.73 |
| 3.8098754124166665 | 4.81 |
| 3.8129366986111113 | 4.62 |
| 3.815997151444445 | 4.4 |
| 3.819057882055555 | 4.54 |
| 3.8221175015 | 4.45 |
| 3.825178787722222 | 4.57 |
| 3.828259519472222 | 4.53 |
| 3.8313224724444446 | 4.46 |
| 3.8343818140833337 | 4.74 |
| 3.837442266916667 | 4.33 |
| 3.8405038309166666 | 4.52 |
| 3.8435640059444443 | 4.42 |
| 3.8466247365833333 | 4.66 |
| 3.849684078222222 | 4.39 |
| 3.8527453644166663 | 4.76 |
| 3.8558049838611113 | 4.5 |
| 3.8588643255277777 | 4.55 |
| 3.861925611722222 | 4.45 |
| 3.864986620138889 | 4.37 |
| 3.8680459618055556 | 4.57 |
| 3.871108636972222 | 4.6 |
| 3.874167978611111 | 4.74 |
| 3.8772284314444443 | 4.47 |
| 3.88029027325 | 4.57 |
| 3.883356004138889 | 4.41 |
| 3.8864172903611114 | 4.68 |
| 3.8894802433333333 | 4.8 |
| 3.8925393071666665 | 4.55 |
| 3.895600315583333 | 4.4 |
| 3.8986674354722224 | 4.58 |
| 3.9017273326944446 | 4.59 |
| 3.9047886189166667 | 4.53 |
| 3.907849905111111 | 4.5 |
| 3.9109092467777775 | 4.34 |
| 3.9139685884166666 | 4.28 |
| 3.917036263888889 | 4.71 |
| 3.9200967166944443 | 4.74 |
| 3.923162447611111 | 4.53 |
| 3.92622651175 | 4.63 |
| 3.9292900203055554 | 4.44 |
| 3.9323507509166666 | 4.32 |
| 3.9354120371388888 | 4.61 |
| 3.938479157 | 4.33 |
| 3.9415482214444446 | 4.62 |
| 3.944609229861111 | 4.44 |
| 3.9476685715 | 4.57 |
| 3.9507315244722223 | 4.54 |
| 3.953792532888889 | 4.74 |
| 3.956856319222222 | 4.53 |
| 3.9599301061666665 | 4.49 |
| 3.9629894478055556 | 4.49 |
| 3.966051011805556 | 4.44 |
| 3.969111464638889 | 4.58 |
| 3.9721730286388888 | 4.54 |
| 3.9752326480833333 | 4.9 |
| 3.978292823111111 | 4.5 |
| 3.981352998138889 | 4.3 |
| 3.984413450972222 | 4.67 |
| 3.9874725148333336 | 4.26 |
| 3.990534634416667 | 4.45 |
| 3.993597587388889 | 4.59 |
| 3.996660540361111 | 4.75 |
| 3.9997196041944445 | 4.53 |
| 4.002781168194444 | 4.37 |
| 4.005847454694444 | 4.65 |
| 4.008909852083334 | 4.91 |
| 4.011969193722222 | 4.46 |
| 4.0150288131666665 | 4.22 |
| 4.018090377166667 | 4.41 |
| 4.021158330444444 | 4.35 |
| 4.0242179498888895 | 4.96 |
| 4.027279236083333 | 4.43 |
| 4.0303385777222225 | 4.68 |
| 4.033402364083333 | 4.38 |
| 4.036462261333333 | 4.52 |
| 4.039527158833334 | 4.65 |
| 4.0425948343055556 | 4.77 |
| 4.0456561205 | 4.56 |
| 4.048716851138889 | 4.84 |
| 4.051778137333334 | 4.51 |
| 4.054837479 | 4.63 |
| 4.057896820638889 | 4.38 |
| 4.060960607 | 4.61 |
| 4.064023559972222 | 4.62 |
| 4.067088457472222 | 4.71 |
| 4.070154466194444 | 4.65 |
| 4.073227141916667 | 4.59 |
| 4.076286761388889 | 4.51 |
| 4.079346380833333 | 4.48 |
| 4.082406833638888 | 4.39 |
| 4.085467008666667 | 4.66 |
| 4.088531350611111 | 4.77 |
| 4.091592359027778 | 4.84 |
| 4.094651700666667 | 4.8 |
| 4.097711042333333 | 4.39 |
| 4.100775939861111 | 4.73 |
| 4.103835003722223 | 4.49 |
| 4.106895456527778 | 4.68 |
| 4.109954798194444 | 4.4 |
| 4.113016639972222 | 4.44 |
| 4.116075703833333 | 4.73 |
| 4.119135323277778 | 4.68 |
| 4.1221966095 | 4.54 |
| 4.125257062305556 | 4.64 |
| 4.128316681749999 | 4.61 |
| 4.131376301194445 | 4.69 |
| 4.1344423099166665 | 4.55 |
| 4.1375047072777775 | 4.51 |
| 4.140565437916667 | 4.66 |
| 4.143626446305555 | 4.58 |
| 4.146686621361111 | 4.54 |
| 4.149746240805555 | 4.5 |
| 4.152806971416667 | 4.43 |
| 4.155866313055555 | 4.28 |
| 4.158928432638889 | 4.54 |
| 4.161989996666667 | 4.29 |
| 4.165056005361111 | 4.48 |
| 4.168115902583334 | 4.36 |
| 4.171176355416667 | 4.43 |
| 4.174239863972222 | 4.63 |
| 4.177299205611111 | 4.71 |
| 4.1803588250555554 | 4.71 |
| 4.183417888916667 | 4.65 |
| 4.1864786195555554 | 4.7 |
| 4.189538516777778 | 4.48 |
| 4.192598969611112 | 4.64 |
| 4.195661367 | 4.76 |
| 4.198720708638889 | 4.51 |
| 4.201780328083333 | 4.39 |
| 4.204840503111111 | 4.64 |
| 4.207900400361111 | 4.42 |
| 4.210962519944444 | 4.47 |
| 4.214026306305556 | 4.55 |
| 4.217087314694444 | 4.51 |
| 4.220146934138889 | 4.43 |
| 4.223211831666667 | 4.74 |
| 4.226275895805555 | 4.81 |
| 4.2293391265833336 | 4.51 |
| 4.232399023805556 | 4.71 |
| 4.235458365472223 | 4.48 |
| 4.238518262722223 | 4.67 |
| 4.241582882444444 | 4.82 |
| 4.244642779666667 | 4.46 |
| 4.247701843527778 | 4.5 |
| 4.250763963111111 | 4.42 |
| 4.253826916083333 | 4.6 |
| 4.256887091111111 | 4.96 |
| 4.259958100111111 | 4.58 |
| 4.263019108527778 | 4.56 |
| 4.26608372825 | 4.62 |
| 4.269147792388889 | 4.27 |
| 4.272207689638889 | 4.68 |
| 4.2752720315833335 | 4.8 |
| 4.278332762194444 | 4.91 |
| 4.2814073825 | 4.7 |
| 4.284469224277778 | 4.81 |
| 4.287529121527777 | 4.74 |
| 4.290597630361112 | 4.67 |
| 4.293659749944444 | 4.76 |
| 4.296724647472222 | 4.41 |
| 4.2997864892777775 | 4.53 |
| 4.302851664583334 | 4.62 |
| 4.305911561833333 | 4.81 |
| 4.308971736861111 | 4.54 |
| 4.312035523222223 | 4.57 |
| 4.315096809416667 | 4.72 |
| 4.31815726225 | 4.59 |
| 4.321217715055555 | 4.7 |
| 4.3242784456944445 | 4.5 |
| 4.327339731888889 | 4.69 |
| 4.330407129555556 | 4.57 |
| 4.333467026805556 | 4.79 |
| 4.336526368444445 | 4.86 |
| 4.339587376861111 | 4.63 |
| 4.342654218944444 | 4.49 |
| 4.3457146717777775 | 4.6 |
| 4.3487770691388885 | 4.64 |
| 4.351843355638889 | 4.46 |
| 4.354902697305556 | 4.47 |
| 4.357962872333333 | 4.47 |
| 4.361025825305555 | 4.67 |
| 4.364092945166666 | 4.44 |
| 4.367152286833334 | 4.43 |
| 4.370218573305555 | 4.68 |
| 4.373279303944444 | 4.21 |
| 4.376340034555556 | 4.31 |
| 4.379408821194445 | 4.49 |
| 4.382476496638889 | 4.43 |
| 4.385536116083333 | 4.73 |
| 4.3885987912777775 | 4.57 |
| 4.391660355277778 | 4.62 |
| 4.394723030444444 | 4.56 |
| 4.397782372083333 | 4.59 |
| 4.400843936083334 | 4.48 |
| 4.403905222305555 | 4.7 |
| 4.406965397333334 | 4.53 |
| 4.410025850166667 | 4.54 |
| 4.413085191805556 | 4.48 |
| 4.41614481125 | 4.54 |
| 4.419204986277777 | 4.28 |
| 4.422264050138889 | 4.59 |
| 4.425323947388889 | 4.65 |
| 4.428390233888889 | 4.41 |
| 4.431457631555555 | 4.5 |
| 4.4345169731944445 | 4.46 |
| 4.437582426305555 | 4.55 |
| 4.440642601333334 | 4.61 |
| 4.4437038875555555 | 4.69 |
| 4.446772396388889 | 4.51 |
| 4.449846183305556 | 4.38 |
| 4.452910803027778 | 4.75 |
| 4.455971533666667 | 4.7 |
| 4.459030875305555 | 4.73 |
| 4.462092994888889 | 4.9 |
| 4.465152892138889 | 4.58 |
| 4.468215845111112 | 4.52 |
| 4.471277686888889 | 4.66 |
| 4.474344528972222 | 4.58 |
| 4.4774041484166665 | 4.56 |
| 4.480465434638889 | 4.28 |
| 4.483527276416667 | 4.4 |
| 4.48658772925 | 4.49 |
| 4.4896476265 | 4.54 |
| 4.492707523722222 | 4.29 |
| 4.495767143166667 | 4.49 |
| 4.4988325962777775 | 4.2 |
| 4.501893326888889 | 4.47 |
| 4.504956835444444 | 4.38 |
| 4.508016454888889 | 4.73 |
| 4.511075796555556 | 4.62 |
| 4.514140971861111 | 4.42 |
| 4.5172005913055555 | 4.32 |
| 4.52026021075 | 4.44 |
| 4.52332177475 | 4.39 |
| 4.526384727722222 | 4.6 |
| 4.529446013944445 | 4.36 |
| 4.532507855722222 | 4.17 |
| 4.535569975305555 | 4.31 |
| 4.53863431725 | 4.41 |
| 4.541697548027778 | 4.51 |
| 4.54475744525 | 4.47 |
| 4.5478173425 | 4.53 |
| 4.550879739861111 | 4.51 |
| 4.553939359305555 | 4.51 |
| 4.55699897875 | 4.25 |
| 4.560059709388889 | 4.33 |
| 4.563123773527777 | 4.61 |
| 4.566184781944444 | 4.43 |
| 4.569244679166667 | 4.29 |
| 4.572304298611111 | 4.22 |
| 4.575363918055555 | 4.33 |
| 4.578424370888889 | 4.14 |
| 4.581483712555556 | 4.21 |
| 4.584544165361112 | 4.46 |
| 4.587604062611111 | 4.13 |
| 4.590667015583334 | 4.17 |
| 4.593728579583334 | 4.42 |
| 4.596788754611111 | 4.34 |
| 4.599850318611112 | 4.59 |
| 4.602911882611111 | 4.38 |
| 4.605979558083333 | 4.25 |
| 4.609046122361112 | 4.13 |
| 4.612109353111111 | 4.32 |
| 4.6151717505 | 4.45 |
| 4.618232758916666 | 4.46 |
| 4.621292378361111 | 4.63 |
| 4.624358664861111 | 4.28 |
| 4.6274213400277775 | 4.76 |
| 4.630484292999999 | 4.05 |
| 4.6335447458333325 | 4.3 |
| 4.636604365277778 | 4.34 |
| 4.639665095888889 | 4.36 |
| 4.6427258265 | 4.76 |
| 4.645786001527777 | 4.5 |
| 4.648845620972223 | 4.44 |
| 4.651904962638889 | 4.54 |
| 4.654964304277778 | 4.35 |
| 4.658024201527778 | 4.45 |
| 4.6610885434444445 | 4.67 |
| 4.664165663888889 | 4.37 |
| 4.667227505694444 | 4.32 |
| 4.670292681027778 | 4.48 |
| 4.673354522805555 | 4.22 |
| 4.676415253416667 | 4.23 |
| 4.679474595083334 | 4.59 |
| 4.6825375480555556 | 4.38 |
| 4.685598000861112 | 4.27 |
| 4.688660953833334 | 4.53 |
| 4.691720295500001 | 4.23 |
| 4.6947815816944445 | 4.5 |
| 4.697841756722223 | 4.51 |
| 4.70090193175 | 4.44 |
| 4.703962106805555 | 4.64 |
| 4.70702172625 | 4.61 |
| 4.710084401416666 | 4.52 |
| 4.713144298666667 | 4.27 |
| 4.7162041958888885 | 4.35 |
| 4.719266037694444 | 4.45 |
| 4.722326212722222 | 4.55 |
| 4.725399444055555 | 4.57 |
| 4.728461008055556 | 4.48 |
| 4.731520627499999 | 4.44 |
| 4.734582747083333 | 4.72 |
| 4.7376426443333335 | 4.42 |
| 4.740702541555556 | 4.33 |
| 4.743781328777779 | 4.6 |
| 4.746840948222222 | 4.47 |
| 4.749903901194445 | 4.58 |
| 4.752963520638889 | 4.5 |
| 4.756023417861111 | 4.47 |
| 4.759084981861111 | 4.58 |
| 4.7621471014444445 | 4.36 |
| 4.765206720888889 | 4.53 |
| 4.7682674515277785 | 4.64 |
| 4.771328182138888 | 4.48 |
| 4.774395301999999 | 4.49 |
| 4.7774557548333325 | 4.28 |
| 4.780519541194444 | 4.46 |
| 4.783579160638889 | 4.42 |
| 4.78663989125 | 4.48 |
| 4.789710066861112 | 4.46 |
| 4.792769964083333 | 4.46 |
| 4.7958295835277776 | 4.49 |
| 4.798891147527778 | 4.45 |
| 4.801951878166666 | 4.52 |
| 4.805011775388889 | 4.7 |
| 4.808074450583334 | 4.26 |
| 4.8111335144166665 | 4.42 |
| 4.814199800916667 | 4.51 |
| 4.81726025375 | 4.21 |
| 4.820322095527778 | 4.68 |
| 4.823381992777778 | 4.45 |
| 4.826454390722223 | 4.25 |
| 4.8295176215 | 4.47 |
| 4.832583630194444 | 4.68 |
| 4.835648249916667 | 4.19 |
| 4.838710925111111 | 4.7 |
| 4.841777489388889 | 4.49 |
| 4.844840720138889 | 4.4 |
| 4.847901728555556 | 4.52 |
| 4.850961347999999 | 4.42 |
| 4.85402124525 | 4.41 |
| 4.857081975861112 | 4.4 |
| 4.8601515958888895 | 4.55 |
| 4.8632109375277786 | 4.43 |
| 4.866271668138889 | 4.35 |
| 4.869334343333334 | 4.55 |
| 4.872396185111111 | 4.84 |
| 4.875460527055556 | 4.45 |
| 4.878522368861111 | 4.31 |
| 4.881583655055556 | 4.58 |
| 4.884646330222222 | 4.49 |
| 4.8877112277500006 | 4.26 |
| 4.890773347333334 | 4.59 |
| 4.893832966777778 | 4.55 |
| 4.896895364166666 | 4.59 |
| 4.899955539194444 | 4.62 |
| 4.9030151586388895 | 4.61 |
| 4.9060745003055555 | 4.66 |
| 4.909137453277778 | 4.38 |
| 4.912234297055555 | 4.14 |
| 4.915293638722223 | 4.68 |
| 4.918354647138888 | 4.5 |
| 4.921417600083333 | 4.57 |
| 4.92447694175 | 4.46 |
| 4.927537950166666 | 4.43 |
| 4.93060006975 | 4.64 |
| 4.933661355944444 | 4.42 |
| 4.936723475527778 | 4.47 |
| 4.939783094972222 | 4.62 |
| 4.942842158833334 | 4.47 |
| 4.9459034450555555 | 4.48 |
| 4.948963342277779 | 4.28 |
| 4.952033795694445 | 4.62 |
| 4.9550942485 | 4.58 |
| 4.958153867944445 | 4.48 |
| 4.9612132096111115 | 4.41 |
| 4.964272829055555 | 4.39 |
| 4.967333559666667 | 4.48 |
| 4.970394845888889 | 4.37 |
| 4.973455020916667 | 4.51 |
| 4.976514362555556 | 4.45 |
| 4.979575648777778 | 4.56 |
| 4.982638879527778 | 4.26 |
| 4.9856998879444445 | 4.49 |
| 4.988760618555555 | 4.68 |
| 4.991820515805555 | 4.55 |
| 4.99488902463889 | 4.4 |
| 4.997951422027778 | 4.67 |
| 5.001012986027778 | 4.43 |
| 5.004075105611111 | 4.59 |
| 5.007145836805555 | 4.54 |
| 5.010211567694444 | 4.45 |
| 5.0132734095 | 4.65 |
| 5.016332751138889 | 4.76 |
| 5.019392092805556 | 4.69 |
| 5.022455045777778 | 4.63 |
| 5.0255196655 | 4.51 |
| 5.028579284944445 | 4.68 |
| 5.031640848944445 | 4.7 |
| 5.034706302055555 | 4.62 |
| 5.037766477083333 | 4.52 |
| 5.040825818749999 | 4.49 |
| 5.043885160388888 | 4.59 |
| 5.046948668944444 | 4.73 |
| 5.050008010611111 | 4.5 |
| 5.053072352527778 | 4.5 |
| 5.056132805361111 | 4.51 |
| 5.059193258194445 | 4.68 |
| 5.062253988805556 | 4.68 |
| 5.0653152750277775 | 4.55 |
| 5.068377394611111 | 4.87 |
| 5.07143673625 | 4.51 |
| 5.074496077916667 | 4.46 |
| 5.077555975138889 | 4.68 |
| 5.080615594583334 | 4.44 |
| 5.083677991972222 | 4.33 |
| 5.086739555972223 | 4.5 |
| 5.089808342611112 | 4.39 |
| 5.092869351027777 | 4.57 |
| 5.095931192805556 | 4.51 |
| 5.098994979166667 | 4.63 |
| 5.102058209916667 | 4.48 |
| 5.105118107166667 | 4.53 |
| 5.108184115861111 | 4.65 |
| 5.111244846472222 | 4.2 |
| 5.1143050215 | 4.28 |
| 5.1173663077222225 | 4.65 |
| 5.120429538472222 | 4.34 |
| 5.123489991305556 | 4.37 |
| 5.126550166333333 | 4.47 |
| 5.129610619166667 | 4.53 |
| 5.13267357213889 | 4.4 |
| 5.135732913777778 | 4.41 |
| 5.1387994780833335 | 4.39 |
| 5.141859375305556 | 4.16 |
| 5.144923439444445 | 4.44 |
| 5.147986392416667 | 4.35 |
| 5.151046289666667 | 4.28 |
| 5.154105909111111 | 4.81 |
| 5.157165528555556 | 4.4 |
| 5.16022681475 | 4.53 |
| 5.1632867120000006 | 4.39 |
| 5.166347442611111 | 4.47 |
| 5.169409284416667 | 4.65 |
| 5.172468626055556 | 4.48 |
| 5.175527689916667 | 4.24 |
| 5.178587864944444 | 4.65 |
| 5.181649428944445 | 4.42 |
| 5.184709603972223 | 4.67 |
| 5.187769223416667 | 4.55 |
| 5.190828287277777 | 4.67 |
| 5.193887906722223 | 4.41 |
| 5.196947803972222 | 4.63 |
| 5.200007145611111 | 4.45 |
| 5.203071765333333 | 4.54 |
| 5.206131940388889 | 4.52 |
| 5.209191004222221 | 4.59 |
| 5.212253957194444 | 4.57 |
| 5.21531413225 | 4.65 |
| 5.218374307277777 | 4.5 |
| 5.221437538027778 | 4.57 |
| 5.224496879694444 | 4.46 |
| 5.227556776916667 | 4.2 |
| 5.230620563277778 | 4.55 |
| 5.23368351625 | 4.25 |
| 5.236746469194444 | 4.59 |
| 5.239808311 | 4.46 |
| 5.2428679304444445 | 4.34 |
| 5.245930327833333 | 4.57 |
| 5.248998558888888 | 4.41 |
| 5.2520592895 | 4.8 |
| 5.255122242472223 | 4.36 |
| 5.258192418055556 | 4.58 |
| 5.261251759722222 | 4.46 |
| 5.264311379166666 | 4.38 |
| 5.2673782212499995 | 3.93 |
| 5.2704406186111115 | 4.37 |
| 5.2735057939444445 | 4.48 |
| 5.276568469111111 | 4.7 |
| 5.279627810777777 | 4.5 |
| 5.282687430222222 | 4.52 |
| 5.2857484386388895 | 4.52 |
| 5.288807780277779 | 4.5 |
| 5.291871566638888 | 4.57 |
| 5.294931463861111 | 4.18 |
| 5.297991638888889 | 4.31 |
| 5.301059869944444 | 4.38 |
| 5.3041283787777775 | 4.56 |
| 5.307189942777778 | 4.4 |
| 5.310254006944445 | 4.67 |
| 5.313318904444444 | 4.43 |
| 5.316379357277778 | 4.47 |
| 5.319441199083333 | 4.4 |
| 5.322501651888889 | 4.29 |
| 5.325564327083334 | 4.59 |
| 5.328623668722222 | 4.63 |
| 5.3316868995 | 4.42 |
| 5.334752352611111 | 4.24 |
| 5.337814472194445 | 4.28 |
| 5.3408765917777785 | 4.49 |
| 5.343938711361112 | 4.21 |
| 5.347007498 | 4.36 |
| 5.350069617583333 | 4.27 |
| 5.35312895925 | 4.6 |
| 5.356189967638889 | 4.63 |
| 5.359250698277778 | 4.43 |
| 5.362311706694444 | 4.4 |
| 5.365373548472222 | 4.39 |
| 5.368433167916667 | 4.53 |
| 5.371493065166667 | 4.55 |
| 5.3745537957777785 | 4.68 |
| 5.377613415222222 | 4.3 |
| 5.380673312472222 | 4.54 |
| 5.383735709833333 | 4.42 |
| 5.386795329277778 | 4.34 |
| 5.389857171083333 | 4.26 |
| 5.392917901694444 | 4.58 |
| 5.395979465694444 | 4.32 |
| 5.399042140888889 | 4.78 |
| 5.402101482527778 | 4.51 |
| 5.405160824166667 | 4.45 |
| 5.40823711125 | 4.57 |
| 5.411297286277778 | 4.34 |
| 5.4143716287777774 | 4.53 |
| 5.417432081611111 | 4.48 |
| 5.42049142325 | 4.36 |
| 5.423550487111111 | 4.77 |
| 5.426611495527778 | 4.44 |
| 5.429671670555556 | 4.59 |
| 5.432733234555555 | 4.37 |
| 5.435793687388888 | 4.39 |
| 5.438853584638889 | 4.48 |
| 5.441913204083333 | 4.49 |
| 5.444976434833333 | 4.27 |
| 5.448035498694444 | 4.73 |
| 5.451094840333333 | 4.57 |
| 5.454160015666666 | 4.42 |
| 5.457227413333333 | 4.38 |
| 5.460290644083333 | 4.54 |
| 5.4633549860277775 | 4.52 |
| 5.4664148832777775 | 4.59 |
| 5.469476725055556 | 4.35 |
| 5.472536622305555 | 4.37 |
| 5.4755976307222225 | 4.44 |
| 5.478665306166667 | 4.63 |
| 5.481725759 | 4.61 |
| 5.484791212111111 | 4.61 |
| 5.487851942722222 | 4.43 |
| 5.490911562166667 | 4.43 |
| 5.493971459416667 | 4.35 |
| 5.497032467833334 | 4.59 |
| 5.50009347625 | 4.58 |
| 5.503155318027778 | 4.16 |
| 5.506214381888889 | 4.53 |
| 5.509274556916667 | 4.51 |
| 5.5123372320833335 | 4.43 |
| 5.515396295944444 | 4.48 |
| 5.5184611934722225 | 4.61 |
| 5.521526091 | 4.53 |
| 5.524587377222222 | 4.49 |
| 5.527650607972222 | 4.69 |
| 5.530711338583334 | 4.19 |
| 5.533771235833333 | 4.56 |
| 5.536831966444445 | 4.52 |
| 5.539904086611112 | 4.4 |
| 5.542964817222222 | 4.73 |
| 5.546030270333333 | 4.55 |
| 5.549091834333334 | 4.44 |
| 5.552151453777777 | 4.58 |
| 5.555213573361111 | 4.46 |
| 5.558285137944444 | 4.4 |
| 5.561345868555556 | 4.45 |
| 5.564414933 | 4.32 |
| 5.567476774777778 | 4.57 |
| 5.570536672027777 | 4.35 |
| 5.573596847055556 | 4.53 |
| 5.576655910916667 | 4.46 |
| 5.579721364027777 | 4.52 |
| 5.5827815390555555 | 4.73 |
| 5.5858411585 | 4.56 |
| 5.588901889111111 | 4.26 |
| 5.591962341944444 | 4.56 |
| 5.595022239194445 | 4.78 |
| 5.598083525388889 | 4.46 |
| 5.6011442559999995 | 4.39 |
| 5.60420415325 | 4.29 |
| 5.607267939611111 | 4.34 |
| 5.610330336972222 | 4.57 |
| 5.613391067611111 | 4.76 |
| 5.61645040925 | 4.68 |
| 5.61951197325 | 4.7 |
| 5.622571592694444 | 4.45 |
| 5.6256334345 | 4.63 |
| 5.628693053944445 | 4.4 |
| 5.631752395583333 | 4.46 |
| 5.634815348555556 | 4.66 |
| 5.637874968 | 4.48 |
| 5.640935976416666 | 4.75 |
| 5.644000318361111 | 4.3 |
| 5.64706132675 | 4.43 |
| 5.650120668416666 | 4.48 |
| 5.653180010055555 | 4.63 |
| 5.6562415740555565 | 4.38 |
| 5.659301749111112 | 4.41 |
| 5.662363035305555 | 4.24 |
| 5.665425154888888 | 4.21 |
| 5.668485329916667 | 4.43 |
| 5.671544671583333 | 4.28 |
| 5.6746054021944445 | 4.04 |
| 5.677665021638889 | 4.64 |
| 5.680724641083333 | 4.4 |
| 5.6837856495 | 4.38 |
| 5.686847769083333 | 4.29 |
| 5.689916000138889 | 4.38 |
| 5.692975619583334 | 4.37 |
| 5.696036350194444 | 4.35 |
| 5.699095969638889 | 4.17 |
| 5.702155866888889 | 4.42 |
| 5.705216875305555 | 4.42 |
| 5.708280661638889 | 4.54 |
| 5.711345836972222 | 4.46 |
| 5.714422401805555 | 4.52 |
| 5.71748202125 | 4.5 |
| 5.720544418638889 | 4.39 |
| 5.723607927194444 | 4.47 |
| 5.726668102222222 | 4.32 |
| 5.729728832861111 | 4.46 |
| 5.732792063611111 | 4.52 |
| 5.735851960861112 | 4.4 |
| 5.738917136166667 | 4.19 |
| 5.741977311194445 | 4.62 |
| 5.745036652861112 | 4.39 |
| 5.748101550388889 | 4.56 |
| 5.751162003194445 | 4.25 |
| 5.754221622638889 | 4.32 |
| 5.757281242083333 | 4.51 |
| 5.760342528305556 | 4.58 |
| 5.763416593027777 | 4.5 |
| 5.766477045833333 | 4.45 |
| 5.7695394432222225 | 4.23 |
| 5.77260045163889 | 4.26 |
| 5.775659793277778 | 4.56 |
| 5.778720801694444 | 4.41 |
| 5.781781810111111 | 4.53 |
| 5.78484115175 | 4.36 |
| 5.7879038269444445 | 4.5 |
| 5.790980669583333 | 4.56 |
| 5.79404001125 | 4.43 |
| 5.797099075111111 | 4.14 |
| 5.800159527916667 | 4.3 |
| 5.80321998075 | 4.34 |
| 5.806285156055555 | 4.51 |
| 5.809346164472222 | 4.36 |
| 5.812407172888888 | 4.66 |
| 5.815469570277777 | 4.48 |
| 5.818533634416666 | 4.56 |
| 5.8215968651944445 | 4.35 |
| 5.824660929333334 | 4.66 |
| 5.827720826555556 | 4.51 |
| 5.830788779805555 | 4.41 |
| 5.833850066027778 | 4.33 |
| 5.836910796638889 | 4.44 |
| 5.8399731940277775 | 4.34 |
| 5.843036146999999 | 4.62 |
| 5.846101044527778 | 4.58 |
| 5.849160663972222 | 4.53 |
| 5.852219727805555 | 4.54 |
| 5.855280180638888 | 4.53 |
| 5.8583417446388895 | 4.87 |
| 5.861403586444444 | 4.56 |
| 5.864463761472222 | 4.5 |
| 5.867525881055555 | 4.4 |
| 5.870588278444444 | 4.42 |
| 5.8736509536111114 | 4.43 |
| 5.876710017472223 | 4.47 |
| 5.8797701925000005 | 4.43 |
| 5.882830367527777 | 4.64 |
| 5.885890542555555 | 4.43 |
| 5.88895071761111 | 4.43 |
| 5.8920147817499995 | 4.68 |
| 5.895074956777778 | 4.36 |
| 5.898138465333334 | 4.78 |
| 5.901199751527778 | 4.45 |
| 5.904259093194445 | 4.84 |
| 5.907318990416667 | 4.87 |
| 5.9103780542777775 | 4.42 |
| 5.913437951527778 | 4.47 |
| 5.916498126555555 | 4.9 |
| 5.919558857166667 | 4.52 |
| 5.92262097675 | 4.71 |
| 5.925681707388889 | 4.79 |
| 5.928749105055555 | 4.32 |
| 5.931808446694444 | 4.43 |
| 5.9348700106944445 | 4.44 |
| 5.9379293523611105 | 4.61 |
| 5.941008972944444 | 4.47 |
| 5.944068592388889 | 4.43 |
| 5.947134323277778 | 4.71 |
| 5.9501944983333335 | 4.58 |
| 5.953263840555556 | 4.45 |
| 5.956326237916667 | 4.59 |
| 5.95939308 | 4.65 |
| 5.9624526994444444 | 4.87 |
| 5.96551204111111 | 4.36 |
| 5.968572771722222 | 4.62 |
| 5.971637113666667 | 4.62 |
| 5.974697288694444 | 4.47 |
| 5.977756352555556 | 4.56 |
| 5.980818194333333 | 4.29 |
| 5.983877258194444 | 4.35 |
| 5.9869391 | 4.6 |
| 5.989998997222222 | 4.57 |
| 5.993059450055555 | 4.31 |
| 5.996118791722223 | 4.19 |
| 5.999179244527778 | 4.51 |
| 6.002241086333333 | 4.34 |
| 6.005300705777778 | 4.44 |
| 6.008367825638889 | 4.26 |
| 6.0114277228888895 | 4.46 |
| 6.014488175722223 | 4.32 |
| 6.017551962055555 | 4.41 |
| 6.020612970472222 | 4.62 |
| 6.023677312416667 | 4.43 |
| 6.026738043027778 | 4.58 |
| 6.02980266275 | 4.33 |
| 6.032863393388888 | 4.58 |
| 6.035923568416667 | 4.56 |
| 6.038982910055555 | 4.22 |
| 6.0420514189166665 | 4.17 |
| 6.045117427611111 | 4.5 |
| 6.048178158222223 | 4.49 |
| 6.051239166638888 | 4.47 |
| 6.054298508277777 | 4.41 |
| 6.057358405527778 | 4.53 |
| 6.060423303055556 | 4.53 |
| 6.06348458925 | 4.41 |
| 6.066548375611111 | 4.29 |
| 6.069609106222222 | 4.52 |
| 6.0726687256666665 | 4.77 |
| 6.075732512027778 | 4.09 |
| 6.07879240925 | 4.39 |
| 6.0818523065 | 4.31 |
| 6.084914703888889 | 4.48 |
| 6.087974323333333 | 4.69 |
| 6.091036442916667 | 4.37 |
| 6.094097451333334 | 4.47 |
| 6.097159293111111 | 4.76 |
| 6.100220023722223 | 4.23 |
| 6.103280476555556 | 4.42 |
| 6.106342596138889 | 4.46 |
| 6.109404993527778 | 4.41 |
| 6.112465446361111 | 4.52 |
| 6.115528399333333 | 4.56 |
| 6.118591907888889 | 4.88 |
| 6.121651805111111 | 4.81 |
| 6.124714480305555 | 4.46 |
| 6.1277749331111115 | 4.46 |
| 6.130836219333333 | 4.45 |
| 6.133898338916667 | 4.47 |
| 6.136959069527777 | 4.34 |
| 6.140022855888889 | 4.53 |
| 6.143083030916666 | 4.45 |
| 6.146142650361112 | 4.52 |
| 6.149204492166667 | 4.45 |
| 6.152263833805556 | 4.6 |
| 6.155323731055556 | 4.33 |
| 6.158385572833333 | 4.5 |
| 6.161445470083334 | 4.5 |
| 6.164505089527777 | 4.51 |
| 6.167573598361111 | 4.5 |
| 6.170633217805555 | 4.4 |
| 6.17369283725 | 4.76 |
| 6.1767527345 | 4.59 |
| 6.179812909527778 | 4.66 |
| 6.182873084555555 | 4.54 |
| 6.185932704 | 4.41 |
| 6.1889934346111115 | 4.52 |
| 6.192058887722222 | 4.53 |
| 6.195124063055556 | 4.83 |
| 6.1981836825 | 4.49 |
| 6.201246635472223 | 4.56 |
| 6.204305977111112 | 4.86 |
| 6.207365040972221 | 4.61 |
| 6.210424660416667 | 4.37 |
| 6.213493447055556 | 4.51 |
| 6.216553344277777 | 4.63 |
| 6.219612963722223 | 4.55 |
| 6.222672860972222 | 4.57 |
| 6.225734424972223 | 4.56 |
| 6.228800155888889 | 4.62 |
| 6.231866720166667 | 4.83 |
| 6.234929117555555 | 4.62 |
| 6.237988459194444 | 4.5 |
| 6.241049189805556 | 4.55 |
| 6.2441085314722224 | 4.23 |
| 6.247168150916666 | 4.36 |
| 6.250227492555555 | 4.64 |
| 6.253288500972222 | 4.4 |
| 6.256348120416667 | 4.43 |
| 6.259411351194445 | 4.5 |
| 6.2624712484166665 | 4.63 |
| 6.2655347569722215 | 4.8 |
| 6.268594654222222 | 4.75 |
| 6.271661774083333 | 4.43 |
| 6.274721671333333 | 4.64 |
| 6.2777957360277785 | 4.82 |
| 6.280855355472222 | 4.67 |
| 6.283920808611112 | 4.74 |
| 6.286980150250001 | 4.65 |
| 6.2900419920555555 | 4.49 |
| 6.2931016115 | 4.36 |
| 6.2961631755 | 4.58 |
| 6.299225295083334 | 4.6 |
| 6.302289637 | 4.44 |
| 6.305348978666666 | 4.64 |
| 6.308408320305555 | 4.63 |
| 6.311469050944445 | 4.78 |
| 6.3145325595 | 4.58 |
| 6.317594679083333 | 4.8 |
| 6.320654298527778 | 4.74 |
| 6.323713917972222 | 4.62 |
| 6.326779093277778 | 4.65 |
| 6.3298389905277785 | 4.52 |
| 6.332899998944444 | 4.56 |
| 6.335962951916667 | 4.47 |
| 6.3390250715 | 4.73 |
| 6.342085524305555 | 4.77 |
| 6.345150699638889 | 4.72 |
| 6.348219486277778 | 4.51 |
| 6.351280494694444 | 4.82 |
| 6.354340391916667 | 4.51 |
| 6.3574025115 | 4.71 |
| 6.360463797722222 | 4.85 |
| 6.363524250555555 | 4.75 |
| 6.36658387 | 4.75 |
| 6.369644045027777 | 4.53 |
| 6.3727067201944445 | 4.41 |
| 6.375766061833334 | 4.45 |
| 6.378830959361111 | 4.4 |
| 6.381890578805556 | 4.48 |
| 6.384950198249999 | 4.47 |
| 6.388009817694445 | 4.7 |
| 6.39107332625 | 4.29 |
| 6.394133779083333 | 4.46 |
| 6.397196176472223 | 4.03 |
| 6.400261074 | 4.63 |
| 6.4033209712222225 | 4.18 |
| 6.406385313166666 | 4.45 |
| 6.409446877166666 | 4.66 |
| 6.412508441166667 | 4.32 |
| 6.415574727666667 | 4.46 |
| 6.418634624888889 | 4.55 |
| 6.421695355527778 | 4.72 |
| 6.424754419388889 | 4.19 |
| 6.4278154277777775 | 4.59 |
| 6.430879491944444 | 4.69 |
| 6.4339393891666665 | 4.37 |
| 6.437003453305556 | 4.41 |
| 6.440064183944444 | 4.25 |
| 6.443124358972222 | 4.68 |
| 6.446183978416667 | 4.93 |
| 6.449243597861111 | 4.28 |
| 6.452302661722222 | 4.65 |
| 6.455362281166667 | 4.65 |
| 6.458424956333333 | 4.43 |
| 6.461484575777778 | 4.75 |
| 6.4645441952222225 | 4.44 |
| 6.467604925833333 | 4.39 |
| 6.470668989972221 | 4.42 |
| 6.473745554833333 | 4.53 |
| 6.47680656325 | 4.43 |
| 6.479865904916667 | 4.43 |
| 6.482929413472222 | 4.72 |
| 6.485990699666666 | 4.34 |
| 6.489050596916667 | 4.44 |
| 6.492111605305556 | 4.46 |
| 6.495170946972222 | 4.41 |
| 6.498232788777777 | 4.52 |
| 6.501294074972222 | 4.46 |
| 6.504357027944444 | 4.56 |
| 6.507416647388889 | 4.6 |
| 6.510480989333334 | 4.76 |
| 6.513540608777777 | 4.41 |
| 6.516602450555555 | 4.5 |
| 6.519669570444444 | 4.36 |
| 6.5227291898888895 | 4.55 |
| 6.525789087111111 | 4.67 |
| 6.528849262138889 | 4.55 |
| 6.531908326000001 | 4.1 |
| 6.534971001194444 | 4.51 |
| 6.538031731805556 | 4.4 |
| 6.541109963416667 | 4.45 |
| 6.544170694027778 | 4.55 |
| 6.547235869361112 | 4.2 |
| 6.5502960443888885 | 4.47 |
| 6.553356775 | 4.57 |
| 6.556416394444445 | 4.63 |
| 6.55947823625 | 4.16 |
| 6.562538133472222 | 4.38 |
| 6.565597475138889 | 4.46 |
| 6.568657372388889 | 4.28 |
| 6.571716991833333 | 4.51 |
| 6.574777722444445 | 4.23 |
| 6.577838730861111 | 4.19 |
| 6.580900850444444 | 4.47 |
| 6.583962414444445 | 4.32 |
| 6.587026200777778 | 4.65 |
| 6.5900972097777775 | 4.26 |
| 6.593157662611111 | 4.5 |
| 6.596220615555556 | 4.32 |
| 6.5992846797222215 | 4.46 |
| 6.602346243722223 | 4.51 |
| 6.605406140944444 | 4.19 |
| 6.6084668715833335 | 4.68 |
| 6.611526213222223 | 4.5 |
| 6.614585554861112 | 4.4 |
| 6.617649896805555 | 4.57 |
| 6.620712294194444 | 4.56 |
| 6.623774691583334 | 4.71 |
| 6.626837644527778 | 4.7 |
| 6.6298989307500005 | 4.58 |
| 6.632958272388889 | 4.61 |
| 6.636017891833333 | 4.53 |
| 6.639078344666666 | 4.75 |
| 6.642162132166667 | 4.6 |
| 6.6452228627777785 | 4.53 |
| 6.648282760027778 | 4.25 |
| 6.65134737975 | 4.73 |
| 6.654409221555556 | 4.58 |
| 6.657469118777778 | 4.7 |
| 6.6605320717500005 | 4.48 |
| 6.6635955803055555 | 4.51 |
| 6.666659366666667 | 4.47 |
| 6.669719541694445 | 4.32 |
| 6.672779716722222 | 4.73 |
| 6.675839336166667 | 4.44 |
| 6.6788995111944445 | 4.32 |
| 6.681960797416666 | 4.57 |
| 6.685020694638889 | 4.65 |
| 6.688081147472222 | 4.51 |
| 6.691140766916666 | 4.52 |
| 6.694203164305556 | 4.66 |
| 6.6972727843055555 | 4.41 |
| 6.700336570666666 | 4.45 |
| 6.7033967456944445 | 4.65 |
| 6.7064566429444445 | 4.37 |
| 6.709515984583334 | 4.93 |
| 6.712579770944445 | 4.53 |
| 6.715639112583333 | 4.68 |
| 6.718700954388889 | 4.39 |
| 6.721761962777778 | 4.46 |
| 6.724821304444444 | 4.67 |
| 6.7278812016666665 | 4.15 |
| 6.730942487888889 | 4.47 |
| 6.734004051888889 | 4.53 |
| 6.737067282638889 | 4.63 |
| 6.740126902083333 | 4.7 |
| 6.743186799333333 | 4.43 |
| 6.746248085527778 | 4.5 |
| 6.749308260583334 | 4.73 |
| 6.752367880027777 | 4.53 |
| 6.755436111055555 | 4.72 |
| 6.758502953138889 | 4.48 |
| 6.761566461694445 | 4.23 |
| 6.764626081138888 | 4.6 |
| 6.76769153425 | 4.65 |
| 6.770750875916667 | 4.37 |
| 6.7738129955 | 4.52 |
| 6.776884560055556 | 4.35 |
| 6.77994723525 | 4.53 |
| 6.783007132472222 | 4.77 |
| 6.786069529861111 | 4.46 |
| 6.789129149305555 | 4.47 |
| 6.792208769888888 | 4.68 |
| 6.795273389638889 | 4.41 |
| 6.798333009083333 | 4.71 |
| 6.801393461888888 | 4.81 |
| 6.8044541925277775 | 4.66 |
| 6.807513811972222 | 4.63 |
| 6.810573431416667 | 4.45 |
| 6.813632773055556 | 4.44 |
| 6.8166940592500005 | 4.41 |
| 6.819753678694444 | 4.23 |
| 6.822818576222223 | 4.33 |
| 6.825877917888889 | 4.44 |
| 6.828939204083333 | 4.63 |
| 6.831999101333333 | 4.27 |
| 6.835060665333334 | 4.6 |
| 6.838125840638889 | 4.66 |
| 6.841192404944445 | 4.5 |
| 6.844253968944444 | 4.28 |
| 6.847313310583333 | 4.33 |
| 6.8503723744444445 | 4.51 |
| 6.8534406055 | 4.78 |
| 6.8564999471388886 | 4.26 |
| 6.8595603999722226 | 4.53 |
| 6.86262140838889 | 4.57 |
| 6.865681305611111 | 4.44 |
| 6.868743703 | 4.46 |
| 6.8718061003888895 | 4.47 |
| 6.874866831 | 4.45 |
| 6.87792672825 | 4.51 |
| 6.88098829225 | 4.35 |
| 6.884051800805555 | 4.31 |
| 6.887111698027778 | 4.62 |
| 6.890171039694445 | 4.61 |
| 6.893230381333333 | 4.35 |
| 6.896292778722222 | 4.42 |
| 6.899353231527777 | 4.41 |
| 6.902414795527778 | 4.38 |
| 6.905476637333334 | 4.32 |
| 6.908536256777778 | 4.28 |
| 6.9115961540277775 | 4.47 |
| 6.914657162444445 | 4.46 |
| 6.91772233775 | 4.32 |
| 6.920781401611111 | 4.58 |
| 6.923853521777778 | 4.41 |
| 6.926923975166667 | 4.39 |
| 6.929991372833333 | 4.34 |
| 6.933050436694445 | 4.43 |
| 6.936109778333333 | 4.46 |
| 6.939169675583334 | 4.34 |
| 6.9422659637777775 | 4.3 |
| 6.945331972472222 | 4.5 |
| 6.948391869722222 | 4.22 |
| 6.951452322555555 | 4.66 |
| 6.954511386416667 | 4.28 |
| 6.957570728055556 | 4.56 |
| 6.960638125722222 | 4.19 |
| 6.963715246166666 | 4.68 |
| 6.966776810166667 | 4.62 |
| 6.969843374444444 | 4.32 |
| 6.972903271694444 | 4.39 |
| 6.975965669083333 | 4.13 |
| 6.979042233944445 | 4.43 |
| 6.982243250361111 | 4.34 |
| 6.985309259055556 | 4.53 |
| 6.988371100861111 | 4.29 |
| 6.991432109250001 | 4.06 |
| 6.99449117311111 | 4.46 |
| 6.997550514777778 | 4.13 |
| 7.000611523194444 | 4.54 |
| 7.003671976 | 4.52 |
| 7.006732984416667 | 4.54 |
| 7.009792326083333 | 4.38 |
| 7.0128566679999995 | 3.94 |
| 7.015917398638889 | 4.4 |
| 7.018980073805556 | 4.43 |
| 7.022040248833334 | 4.17 |
| 7.025100146083333 | 4.29 |
| 7.028173377416667 | 4.48 |
| 7.031236052583334 | 4.48 |
| 7.034295672027778 | 4.44 |
| 7.037358069416666 | 4.32 |
| 7.0404185222499995 | 4.51 |
| 7.043478419472223 | 4.31 |
| 7.046543039194444 | 4.58 |
| 7.04960654775 | 4.42 |
| 7.052667556166667 | 4.27 |
| 7.05573912075 | 4.25 |
| 7.058807351805555 | 4.18 |
| 7.061867249027778 | 4.18 |
| 7.064930757583333 | 4.51 |
| 7.067991488222222 | 4.41 |
| 7.071056107944444 | 4.23 |
| 7.074127950305556 | 4.35 |
| 7.0771881253333335 | 4.13 |
| 7.080249133750001 | 4.14 |
| 7.083308753194444 | 4.11 |
| 7.086368928222223 | 4.28 |
| 7.08942910325 | 4.39 |
| 7.092490111666667 | 4.43 |
| 7.095563343 | 4.35 |
| 7.098623518027778 | 4.34 |
| 7.101685637638889 | 4.26 |
| 7.104744979277778 | 4.56 |
| 7.107806265472222 | 4.28 |
| 7.110865607138889 | 4.5 |
| 7.113927448916667 | 4.29 |
| 7.116987346166666 | 4.33 |
| 7.120048354583333 | 4.17 |
| 7.123109363 | 4.34 |
| 7.126168982444444 | 4.22 |
| 7.129230824222223 | 4.58 |
| 7.132290165888889 | 4.26 |
| 7.135352007666667 | 4.64 |
| 7.138412182722223 | 4.56 |
| 7.141475969055556 | 4.6 |
| 7.144535866305556 | 4.58 |
| 7.147601597194445 | 4.29 |
| 7.150664827972222 | 4.35 |
| 7.153723891833334 | 4.2 |
| 7.1567851780277785 | 4.77 |
| 7.159846186444444 | 4.34 |
| 7.162906083666667 | 4.62 |
| 7.165969036638889 | 4.35 |
| 7.169031156222222 | 4.52 |
| 7.172094664805555 | 4.39 |
| 7.175155395416667 | 4.44 |
| 7.178214737055556 | 4.53 |
| 7.18127741225 | 4.4 |
| 7.184338420638889 | 4.58 |
| 7.187398317888889 | 4.41 |
| 7.190457937333333 | 4.49 |
| 7.193519223527778 | 4.56 |
| 7.19658050975 | 4.48 |
| 7.199640129194444 | 4.65 |
| 7.202701693194444 | 4.49 |
| 7.2057615904166665 | 4.53 |
| 7.208836488527778 | 4.37 |
| 7.211898330333334 | 4.18 |
| 7.214960449916667 | 4.53 |
| 7.218019791555556 | 4.37 |
| 7.221079411 | 4.72 |
| 7.224139030444444 | 4.44 |
| 7.227204483555556 | 4.4 |
| 7.230273825777777 | 4.41 |
| 7.233335945361111 | 4.51 |
| 7.23639834275 | 4.5 |
| 7.239457962194445 | 4.49 |
| 7.242517303861111 | 4.65 |
| 7.245576923305555 | 4.56 |
| 7.248637376111111 | 4.53 |
| 7.251698940111112 | 4.36 |
| 7.2547596707499995 | 4.49 |
| 7.257820123555555 | 4.15 |
| 7.260879743 | 4.49 |
| 7.263942695972223 | 4.52 |
| 7.267003426583333 | 4.37 |
| 7.270065823972222 | 4.33 |
| 7.273125721222223 | 4.44 |
| 7.276187285222222 | 4.34 |
| 7.279248015833334 | 4.65 |
| 7.282310135416667 | 4.49 |
| 7.28537058825 | 4.43 |
| 7.2884327078333335 | 4.29 |
| 7.291496771972223 | 4.25 |
| 7.294558335972222 | 4.13 |
| 7.297619344388889 | 4.63 |
| 7.300681741777778 | 4.41 |
| 7.3037419168055555 | 4.32 |
| 7.306802369638889 | 4.12 |
| 7.309870322888889 | 4.46 |
| 7.312935498194444 | 4.28 |
| 7.315996784416667 | 4.33 |
| 7.319056959444445 | 4.18 |
| 7.322126023861111 | 4.27 |
| 7.325189254638889 | 4.35 |
| 7.328250263055556 | 4.08 |
| 7.331310715861111 | 4.21 |
| 7.334370057527778 | 4.23 |
| 7.337431343722222 | 4.34 |
| 7.340513186666667 | 4.38 |
| 7.343573917277778 | 4.37 |
| 7.346641037166666 | 4.47 |
| 7.349701767777778 | 4.42 |
| 7.352762220611111 | 4.42 |
| 7.355823784611111 | 4.33 |
| 7.358886459777778 | 4.09 |
| 7.3619483015833325 | 4.7 |
| 7.365009587777777 | 4.39 |
| 7.368071985166667 | 4.34 |
| 7.371131049027778 | 4.15 |
| 7.374206502694444 | 4.62 |
| 7.3772775116944445 | 4.4 |
| 7.380337408916667 | 4.34 |
| 7.383396472777777 | 4.37 |
| 7.386455814444445 | 4.43 |
| 7.389515433888889 | 4.3 |
| 7.392575886694445 | 4.49 |
| 7.395639673055556 | 4.29 |
| 7.398702903833334 | 4.32 |
| 7.401763078861111 | 4.34 |
| 7.404824642861111 | 4.4 |
| 7.407885095666667 | 4.18 |
| 7.410944715111111 | 4.19 |
| 7.414004056777778 | 4.33 |
| 7.417064787388889 | 4.54 |
| 7.420126629194445 | 4.25 |
| 7.423186526416666 | 4.38 |
| 7.426247534833333 | 4.4 |
| 7.429307154277778 | 4.32 |
| 7.432379274444444 | 4.16 |
| 7.435438616083333 | 4.42 |
| 7.438499902305556 | 4.54 |
| 7.441570355694444 | 4.42 |
| 7.444633308666667 | 4.08 |
| 7.447694317083333 | 4.17 |
| 7.450753380944444 | 4.23 |
| 7.453813833750001 | 4.13 |
| 7.456874286583334 | 4.45 |
| 7.459935017194445 | 4.18 |
| 7.462994081055555 | 4.45 |
| 7.4660556450555555 | 4.06 |
| 7.469131376555556 | 4.54 |
| 7.472204607888889 | 4.59 |
| 7.475265060694444 | 4.24 |
| 7.4783255135277775 | 4.32 |
| 7.481389855472222 | 4.2 |
| 7.4844489193333334 | 4.4 |
| 7.487509927722223 | 4.24 |
| 7.490577603194445 | 4.4 |
| 7.493641667333334 | 4.23 |
| 7.496704898111111 | 4.18 |
| 7.499765628722222 | 4.22 |
| 7.502825248166667 | 4.36 |
| 7.505887089972223 | 4.24 |
| 7.508949765138889 | 4.29 |
| 7.512009106777778 | 4.19 |
| 7.515069559611111 | 4.33 |
| 7.518132512583334 | 4.27 |
| 7.521192132027777 | 4.31 |
| 7.524252307055556 | 4.3 |
| 7.527319149138889 | 4.2 |
| 7.53037987975 | 4.21 |
| 7.533442277138889 | 4.72 |
| 7.536508008055556 | 4.36 |
| 7.539573738944445 | 4.52 |
| 7.542633080611111 | 4.29 |
| 7.545693533416667 | 4.37 |
| 7.548754264055555 | 4.35 |
| 7.551814716861111 | 4.44 |
| 7.554874614111111 | 4.4 |
| 7.557935344722223 | 4.25 |
| 7.560995797555556 | 4.22 |
| 7.564055972583334 | 4.23 |
| 7.56711614761111 | 4.47 |
| 7.570175767055556 | 4.48 |
| 7.573237608861111 | 4.43 |
| 7.576309173416666 | 4.28 |
| 7.57936962625 | 4.33 |
| 7.582428967916667 | 4.61 |
| 7.585488309555556 | 4.27 |
| 7.5885520959166675 | 4.48 |
| 7.591613104305555 | 4.1 |
| 7.5946738349444445 | 4.39 |
| 7.597736510111111 | 4.19 |
| 7.600798074111111 | 4.55 |
| 7.60385824913889 | 4.27 |
| 7.606918701972223 | 4.52 |
| 7.6099783214166665 | 4.14 |
| 7.613041829972222 | 4.55 |
| 7.616102838388889 | 4.24 |
| 7.619170791638888 | 4.21 |
| 7.622230133277777 | 4.82 |
| 7.625290863916667 | 4.39 |
| 7.628353816888889 | 4.2 |
| 7.631413991916667 | 4.28 |
| 7.634474444722223 | 4.36 |
| 7.637546842694444 | 4.19 |
| 7.640610351249999 | 4.47 |
| 7.6436713596666666 | 4.46 |
| 7.646730701305556 | 4.42 |
| 7.649791431916666 | 4.49 |
| 7.652850495777778 | 4.32 |
| 7.655910948611111 | 4.53 |
| 7.658973068194444 | 4.48 |
| 7.662037132333333 | 4.41 |
| 7.66509814075 | 4.37 |
| 7.668157760194444 | 4.29 |
| 7.671217657444444 | 4.26 |
| 7.6742797770277775 | 4.47 |
| 7.677339118666667 | 4.59 |
| 7.680404016194444 | 4.62 |
| 7.683478914305556 | 4.88 |
| 7.686538255944445 | 4.51 |
| 7.689599819944444 | 4.63 |
| 7.692663328499999 | 4.37 |
| 7.695727392638888 | 4.52 |
| 7.69878951225 | 4.44 |
| 7.701849965055556 | 4.25 |
| 7.704910695694444 | 4.35 |
| 7.707971426305556 | 4.45 |
| 7.711031323527778 | 4.81 |
| 7.714091220777778 | 4.25 |
| 7.717150562416667 | 4.34 |
| 7.720210737472223 | 4.41 |
| 7.723273134833334 | 4.41 |
| 7.726333032083333 | 4.6 |
| 7.7293937626944444 | 4.54 |
| 7.732454493305555 | 4.47 |
| 7.735520502027778 | 4.41 |
| 7.738580677055556 | 4.64 |
| 7.741671409388889 | 4.12 |
| 7.744743807333333 | 4.41 |
| 7.747803982361111 | 4.11 |
| 7.7508636018055554 | 4.33 |
| 7.753927110361111 | 4.37 |
| 7.7569870076111105 | 4.4 |
| 7.760046627055556 | 4.46 |
| 7.763107079888889 | 4.34 |
| 7.766166977111111 | 4.55 |
| 7.769230763472222 | 4.39 |
| 7.772293994222222 | 4.57 |
| 7.775357780583334 | 4.35 |
| 7.7784243448611115 | 4.8 |
| 7.781495353861111 | 4.52 |
| 7.784554973305556 | 4.56 |
| 7.787619593027777 | 4.59 |
| 7.7906789346666665 | 4.59 |
| 7.793741887638889 | 4.45 |
| 7.796806785166667 | 4.54 |
| 7.79986890475 | 4.4 |
| 7.802928801999999 | 4.53 |
| 7.805991754972222 | 4.47 |
| 7.809051652194444 | 4.77 |
| 7.812111549444445 | 4.5 |
| 7.815182002833333 | 4.39 |
| 7.818244678027778 | 4.43 |
| 7.821304575249999 | 4.51 |
| 7.8243914184722225 | 4.44 |
| 7.8274543714444444 | 4.49 |
| 7.830515657638889 | 4.38 |
| 7.833579444000001 | 4.42 |
| 7.836639063444444 | 4.28 |
| 7.839702849805556 | 4.4 |
| 7.842765524972222 | 4.31 |
| 7.845826255583334 | 4.6 |
| 7.848893931055556 | 4.41 |
| 7.851955772833334 | 4.41 |
| 7.855015392277777 | 4.45 |
| 7.858076956277778 | 4.24 |
| 7.861143242777778 | 4.81 |
| 7.864202862222222 | 4.24 |
| 7.867262481666667 | 4.32 |
| 7.870324323472222 | 4.44 |
| 7.873383942916667 | 4.57 |
| 7.876443284555556 | 4.45 |
| 7.879503459583334 | 4.37 |
| 7.882564468000001 | 4.48 |
| 7.88562436525 | 4.56 |
| 7.88868592925 | 4.55 |
| 7.891748326638889 | 4.47 |
| 7.894808501666667 | 4.45 |
| 7.897868121111111 | 4.19 |
| 7.90092746275 | 4.11 |
| 7.903987637777778 | 4.4 |
| 7.907047812805556 | 4.57 |
| 7.91010743225 | 4.22 |
| 7.913170940805555 | 4.17 |
| 7.916231115861111 | 4.39 |
| 7.919293513222223 | 4.51 |
| 7.922353688277778 | 4.48 |
| 7.925419141388889 | 4.51 |
| 7.92848153875 | 4.34 |
| 7.931540880416667 | 4.25 |
| 7.934602444416667 | 4.43 |
| 7.937664008416666 | 4.32 |
| 7.940724183444445 | 4.51 |
| 7.9437843584722225 | 4.43 |
| 7.9468445335 | 4.57 |
| 7.949905819722223 | 4.71 |
| 7.952965161361111 | 4.42 |
| 7.9560264475833335 | 4.37 |
| 7.959089956138889 | 4.73 |
| 7.962149297777778 | 4.32 |
| 7.9652164176388895 | 4.73 |
| 7.968277703861111 | 4.46 |
| 7.971338712277778 | 4.54 |
| 7.974427500055556 | 4.25 |
| 7.9774893418333335 | 4.51 |
| 7.980554239361112 | 4.63 |
| 7.983617470138889 | 4.25 |
| 7.986677367361111 | 4.63 |
| 7.989746431805556 | 4.76 |
| 7.992807162416667 | 4.37 |
| 7.995886505222223 | 4.5 |
| 7.998949180388888 | 4.72 |
| 8.002008799833334 | 4.8 |